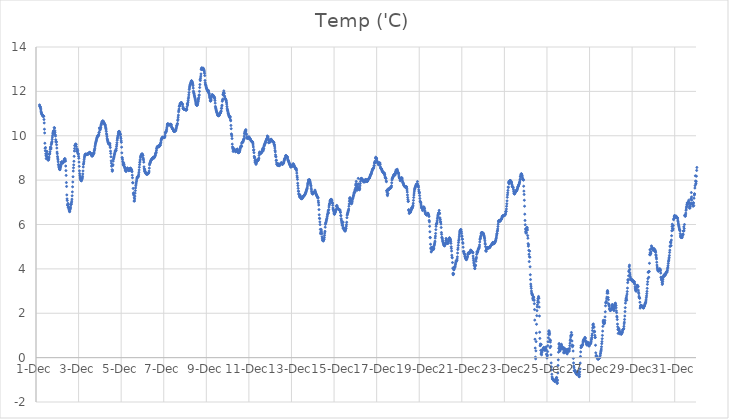
| Category | Temp ('C) |
|---|---|
| 44896.166666666664 | 11.391 |
| 44896.177083333336 | 11.339 |
| 44896.1875 | 11.316 |
| 44896.197916666664 | 11.309 |
| 44896.208333333336 | 11.271 |
| 44896.21875 | 11.222 |
| 44896.229166666664 | 11.162 |
| 44896.239583333336 | 11.088 |
| 44896.25 | 11.041 |
| 44896.260416666664 | 11.013 |
| 44896.270833333336 | 10.977 |
| 44896.28125 | 10.951 |
| 44896.291666666664 | 10.938 |
| 44896.302083333336 | 10.939 |
| 44896.3125 | 10.911 |
| 44896.322916666664 | 10.886 |
| 44896.333333333336 | 10.874 |
| 44896.34375 | 10.889 |
| 44896.354166666664 | 10.885 |
| 44896.364583333336 | 10.873 |
| 44896.375 | 10.732 |
| 44896.385416666664 | 10.577 |
| 44896.395833333336 | 10.295 |
| 44896.40625 | 10.127 |
| 44896.416666666664 | 9.662 |
| 44896.427083333336 | 9.436 |
| 44896.4375 | 9.321 |
| 44896.447916666664 | 9.469 |
| 44896.458333333336 | 9.188 |
| 44896.46875 | 9.108 |
| 44896.479166666664 | 8.969 |
| 44896.489583333336 | 9.061 |
| 44896.5 | 9.306 |
| 44896.510416666664 | 9.278 |
| 44896.520833333336 | 9.178 |
| 44896.53125 | 9.051 |
| 44896.541666666664 | 9.032 |
| 44896.552083333336 | 8.95 |
| 44896.5625 | 8.908 |
| 44896.572916666664 | 8.903 |
| 44896.583333333336 | 8.914 |
| 44896.59375 | 8.925 |
| 44896.604166666664 | 8.995 |
| 44896.614583333336 | 9.039 |
| 44896.625 | 9.162 |
| 44896.635416666664 | 9.163 |
| 44896.645833333336 | 9.211 |
| 44896.65625 | 9.28 |
| 44896.666666666664 | 9.394 |
| 44896.677083333336 | 9.49 |
| 44896.6875 | 9.467 |
| 44896.697916666664 | 9.399 |
| 44896.708333333336 | 9.448 |
| 44896.71875 | 9.598 |
| 44896.729166666664 | 9.654 |
| 44896.739583333336 | 9.693 |
| 44896.75 | 9.741 |
| 44896.760416666664 | 9.843 |
| 44896.770833333336 | 9.94 |
| 44896.78125 | 10.018 |
| 44896.791666666664 | 10.097 |
| 44896.802083333336 | 10.144 |
| 44896.8125 | 10.182 |
| 44896.822916666664 | 10.217 |
| 44896.833333333336 | 10.23 |
| 44896.84375 | 10.131 |
| 44896.854166666664 | 10.368 |
| 44896.864583333336 | 10.097 |
| 44896.875 | 10.349 |
| 44896.885416666664 | 10.229 |
| 44896.895833333336 | 10.158 |
| 44896.90625 | 10.047 |
| 44896.916666666664 | 9.984 |
| 44896.927083333336 | 9.823 |
| 44896.9375 | 9.74 |
| 44896.947916666664 | 9.703 |
| 44896.958333333336 | 9.733 |
| 44896.96875 | 9.595 |
| 44896.979166666664 | 9.445 |
| 44896.989583333336 | 9.265 |
| 44897.0 | 9.19 |
| 44897.010416666664 | 9.067 |
| 44897.020833333336 | 8.992 |
| 44897.03125 | 8.917 |
| 44897.041666666664 | 8.825 |
| 44897.052083333336 | 8.704 |
| 44897.0625 | 8.685 |
| 44897.072916666664 | 8.6 |
| 44897.083333333336 | 8.561 |
| 44897.09375 | 8.501 |
| 44897.104166666664 | 8.502 |
| 44897.114583333336 | 8.482 |
| 44897.125 | 8.467 |
| 44897.135416666664 | 8.526 |
| 44897.145833333336 | 8.573 |
| 44897.15625 | 8.616 |
| 44897.166666666664 | 8.653 |
| 44897.177083333336 | 8.729 |
| 44897.1875 | 8.782 |
| 44897.197916666664 | 8.812 |
| 44897.208333333336 | 8.83 |
| 44897.21875 | 8.805 |
| 44897.229166666664 | 8.784 |
| 44897.239583333336 | 8.779 |
| 44897.25 | 8.771 |
| 44897.260416666664 | 8.77 |
| 44897.270833333336 | 8.783 |
| 44897.28125 | 8.801 |
| 44897.291666666664 | 8.825 |
| 44897.302083333336 | 8.85 |
| 44897.3125 | 8.885 |
| 44897.322916666664 | 8.907 |
| 44897.333333333336 | 8.941 |
| 44897.34375 | 8.941 |
| 44897.354166666664 | 8.971 |
| 44897.364583333336 | 8.951 |
| 44897.375 | 8.905 |
| 44897.385416666664 | 8.853 |
| 44897.395833333336 | 8.636 |
| 44897.40625 | 8.429 |
| 44897.416666666664 | 8.213 |
| 44897.427083333336 | 7.89 |
| 44897.4375 | 7.715 |
| 44897.447916666664 | 7.333 |
| 44897.458333333336 | 7.156 |
| 44897.46875 | 7.08 |
| 44897.479166666664 | 6.883 |
| 44897.489583333336 | 6.858 |
| 44897.5 | 6.948 |
| 44897.510416666664 | 6.778 |
| 44897.520833333336 | 6.909 |
| 44897.53125 | 6.745 |
| 44897.541666666664 | 6.789 |
| 44897.552083333336 | 6.676 |
| 44897.5625 | 6.645 |
| 44897.572916666664 | 6.582 |
| 44897.583333333336 | 6.579 |
| 44897.59375 | 6.657 |
| 44897.604166666664 | 6.696 |
| 44897.614583333336 | 6.724 |
| 44897.625 | 6.783 |
| 44897.635416666664 | 6.898 |
| 44897.645833333336 | 6.896 |
| 44897.65625 | 6.924 |
| 44897.666666666664 | 6.984 |
| 44897.677083333336 | 7.051 |
| 44897.6875 | 7.142 |
| 44897.697916666664 | 7.295 |
| 44897.708333333336 | 7.47 |
| 44897.71875 | 7.698 |
| 44897.729166666664 | 7.916 |
| 44897.739583333336 | 8.153 |
| 44897.75 | 8.409 |
| 44897.760416666664 | 8.556 |
| 44897.770833333336 | 8.687 |
| 44897.78125 | 8.848 |
| 44897.791666666664 | 9.073 |
| 44897.802083333336 | 9.313 |
| 44897.8125 | 9.424 |
| 44897.822916666664 | 9.548 |
| 44897.833333333336 | 9.563 |
| 44897.84375 | 9.586 |
| 44897.854166666664 | 9.618 |
| 44897.864583333336 | 9.623 |
| 44897.875 | 9.593 |
| 44897.885416666664 | 9.617 |
| 44897.895833333336 | 9.508 |
| 44897.90625 | 9.296 |
| 44897.916666666664 | 9.38 |
| 44897.927083333336 | 9.397 |
| 44897.9375 | 9.402 |
| 44897.947916666664 | 9.296 |
| 44897.958333333336 | 9.336 |
| 44897.96875 | 9.21 |
| 44897.979166666664 | 9.182 |
| 44897.989583333336 | 9.176 |
| 44898.0 | 9.075 |
| 44898.010416666664 | 8.984 |
| 44898.020833333336 | 8.813 |
| 44898.03125 | 8.621 |
| 44898.041666666664 | 8.419 |
| 44898.052083333336 | 8.294 |
| 44898.0625 | 8.206 |
| 44898.072916666664 | 8.137 |
| 44898.083333333336 | 8.074 |
| 44898.09375 | 8.039 |
| 44898.104166666664 | 8.009 |
| 44898.114583333336 | 7.985 |
| 44898.125 | 7.979 |
| 44898.135416666664 | 7.968 |
| 44898.145833333336 | 8.045 |
| 44898.15625 | 8.043 |
| 44898.166666666664 | 8.062 |
| 44898.177083333336 | 8.107 |
| 44898.1875 | 8.17 |
| 44898.197916666664 | 8.278 |
| 44898.208333333336 | 8.414 |
| 44898.21875 | 8.592 |
| 44898.229166666664 | 8.709 |
| 44898.239583333336 | 8.765 |
| 44898.25 | 8.825 |
| 44898.260416666664 | 8.917 |
| 44898.270833333336 | 8.997 |
| 44898.28125 | 9.055 |
| 44898.291666666664 | 9.101 |
| 44898.302083333336 | 9.15 |
| 44898.3125 | 9.169 |
| 44898.322916666664 | 9.175 |
| 44898.333333333336 | 9.149 |
| 44898.34375 | 9.141 |
| 44898.354166666664 | 9.146 |
| 44898.364583333336 | 9.156 |
| 44898.375 | 9.161 |
| 44898.385416666664 | 9.165 |
| 44898.395833333336 | 9.17 |
| 44898.40625 | 9.176 |
| 44898.416666666664 | 9.167 |
| 44898.427083333336 | 9.156 |
| 44898.4375 | 9.167 |
| 44898.447916666664 | 9.188 |
| 44898.458333333336 | 9.188 |
| 44898.46875 | 9.213 |
| 44898.479166666664 | 9.219 |
| 44898.489583333336 | 9.213 |
| 44898.5 | 9.225 |
| 44898.510416666664 | 9.229 |
| 44898.520833333336 | 9.254 |
| 44898.53125 | 9.235 |
| 44898.541666666664 | 9.227 |
| 44898.552083333336 | 9.233 |
| 44898.5625 | 9.206 |
| 44898.572916666664 | 9.18 |
| 44898.583333333336 | 9.148 |
| 44898.59375 | 9.143 |
| 44898.604166666664 | 9.134 |
| 44898.614583333336 | 9.112 |
| 44898.625 | 9.083 |
| 44898.635416666664 | 9.084 |
| 44898.645833333336 | 9.094 |
| 44898.65625 | 9.109 |
| 44898.666666666664 | 9.115 |
| 44898.677083333336 | 9.147 |
| 44898.6875 | 9.215 |
| 44898.697916666664 | 9.193 |
| 44898.708333333336 | 9.19 |
| 44898.71875 | 9.209 |
| 44898.729166666664 | 9.261 |
| 44898.739583333336 | 9.324 |
| 44898.75 | 9.373 |
| 44898.760416666664 | 9.427 |
| 44898.770833333336 | 9.501 |
| 44898.78125 | 9.574 |
| 44898.791666666664 | 9.63 |
| 44898.802083333336 | 9.674 |
| 44898.8125 | 9.712 |
| 44898.822916666664 | 9.744 |
| 44898.833333333336 | 9.782 |
| 44898.84375 | 9.826 |
| 44898.854166666664 | 9.874 |
| 44898.864583333336 | 9.914 |
| 44898.875 | 9.938 |
| 44898.885416666664 | 9.964 |
| 44898.895833333336 | 9.98 |
| 44898.90625 | 9.999 |
| 44898.916666666664 | 10.022 |
| 44898.927083333336 | 10.011 |
| 44898.9375 | 10 |
| 44898.947916666664 | 10.064 |
| 44898.958333333336 | 10.136 |
| 44898.96875 | 10.156 |
| 44898.979166666664 | 10.354 |
| 44898.989583333336 | 10.338 |
| 44899.0 | 10.251 |
| 44899.010416666664 | 10.278 |
| 44899.020833333336 | 10.3 |
| 44899.03125 | 10.351 |
| 44899.041666666664 | 10.374 |
| 44899.052083333336 | 10.458 |
| 44899.0625 | 10.506 |
| 44899.072916666664 | 10.541 |
| 44899.083333333336 | 10.557 |
| 44899.09375 | 10.591 |
| 44899.104166666664 | 10.636 |
| 44899.114583333336 | 10.633 |
| 44899.125 | 10.643 |
| 44899.135416666664 | 10.676 |
| 44899.145833333336 | 10.653 |
| 44899.15625 | 10.645 |
| 44899.166666666664 | 10.643 |
| 44899.177083333336 | 10.617 |
| 44899.1875 | 10.585 |
| 44899.197916666664 | 10.578 |
| 44899.208333333336 | 10.552 |
| 44899.21875 | 10.537 |
| 44899.229166666664 | 10.513 |
| 44899.239583333336 | 10.497 |
| 44899.25 | 10.477 |
| 44899.260416666664 | 10.432 |
| 44899.270833333336 | 10.368 |
| 44899.28125 | 10.329 |
| 44899.291666666664 | 10.266 |
| 44899.302083333336 | 10.193 |
| 44899.3125 | 10.094 |
| 44899.322916666664 | 10.039 |
| 44899.333333333336 | 9.956 |
| 44899.34375 | 9.867 |
| 44899.354166666664 | 9.826 |
| 44899.364583333336 | 9.786 |
| 44899.375 | 9.734 |
| 44899.385416666664 | 9.703 |
| 44899.395833333336 | 9.671 |
| 44899.40625 | 9.647 |
| 44899.416666666664 | 9.63 |
| 44899.427083333336 | 9.636 |
| 44899.4375 | 9.631 |
| 44899.447916666664 | 9.624 |
| 44899.458333333336 | 9.611 |
| 44899.46875 | 9.655 |
| 44899.479166666664 | 9.541 |
| 44899.489583333336 | 9.466 |
| 44899.5 | 9.306 |
| 44899.510416666664 | 9.204 |
| 44899.520833333336 | 9.053 |
| 44899.53125 | 8.868 |
| 44899.541666666664 | 8.765 |
| 44899.552083333336 | 8.625 |
| 44899.5625 | 8.664 |
| 44899.572916666664 | 8.47 |
| 44899.583333333336 | 8.399 |
| 44899.59375 | 8.448 |
| 44899.604166666664 | 8.653 |
| 44899.614583333336 | 8.698 |
| 44899.625 | 8.855 |
| 44899.635416666664 | 8.93 |
| 44899.645833333336 | 8.982 |
| 44899.65625 | 9.022 |
| 44899.666666666664 | 9.072 |
| 44899.677083333336 | 9.127 |
| 44899.6875 | 9.162 |
| 44899.697916666664 | 9.214 |
| 44899.708333333336 | 9.263 |
| 44899.71875 | 9.311 |
| 44899.729166666664 | 9.337 |
| 44899.739583333336 | 9.304 |
| 44899.75 | 9.33 |
| 44899.760416666664 | 9.346 |
| 44899.770833333336 | 9.418 |
| 44899.78125 | 9.511 |
| 44899.791666666664 | 9.593 |
| 44899.802083333336 | 9.686 |
| 44899.8125 | 9.797 |
| 44899.822916666664 | 9.862 |
| 44899.833333333336 | 9.917 |
| 44899.84375 | 9.98 |
| 44899.854166666664 | 10.016 |
| 44899.864583333336 | 10.084 |
| 44899.875 | 10.147 |
| 44899.885416666664 | 10.181 |
| 44899.895833333336 | 10.196 |
| 44899.90625 | 10.2 |
| 44899.916666666664 | 10.183 |
| 44899.927083333336 | 10.147 |
| 44899.9375 | 10.105 |
| 44899.947916666664 | 10.07 |
| 44899.958333333336 | 10.046 |
| 44899.96875 | 10.064 |
| 44899.979166666664 | 9.944 |
| 44899.989583333336 | 9.872 |
| 44900.0 | 9.771 |
| 44900.010416666664 | 9.704 |
| 44900.020833333336 | 9.485 |
| 44900.03125 | 9.228 |
| 44900.041666666664 | 9.02 |
| 44900.052083333336 | 8.996 |
| 44900.0625 | 8.93 |
| 44900.072916666664 | 8.842 |
| 44900.083333333336 | 8.774 |
| 44900.09375 | 8.706 |
| 44900.104166666664 | 8.672 |
| 44900.114583333336 | 8.692 |
| 44900.125 | 8.77 |
| 44900.135416666664 | 8.703 |
| 44900.145833333336 | 8.627 |
| 44900.15625 | 8.604 |
| 44900.166666666664 | 8.581 |
| 44900.177083333336 | 8.518 |
| 44900.1875 | 8.504 |
| 44900.197916666664 | 8.434 |
| 44900.208333333336 | 8.444 |
| 44900.21875 | 8.416 |
| 44900.229166666664 | 8.388 |
| 44900.239583333336 | 8.421 |
| 44900.25 | 8.455 |
| 44900.260416666664 | 8.493 |
| 44900.270833333336 | 8.486 |
| 44900.28125 | 8.501 |
| 44900.291666666664 | 8.546 |
| 44900.302083333336 | 8.538 |
| 44900.3125 | 8.506 |
| 44900.322916666664 | 8.478 |
| 44900.333333333336 | 8.459 |
| 44900.34375 | 8.442 |
| 44900.354166666664 | 8.429 |
| 44900.364583333336 | 8.427 |
| 44900.375 | 8.44 |
| 44900.385416666664 | 8.463 |
| 44900.395833333336 | 8.478 |
| 44900.40625 | 8.513 |
| 44900.416666666664 | 8.526 |
| 44900.427083333336 | 8.54 |
| 44900.4375 | 8.531 |
| 44900.447916666664 | 8.522 |
| 44900.458333333336 | 8.505 |
| 44900.46875 | 8.49 |
| 44900.479166666664 | 8.458 |
| 44900.489583333336 | 8.394 |
| 44900.5 | 8.453 |
| 44900.510416666664 | 8.382 |
| 44900.520833333336 | 8.224 |
| 44900.53125 | 8.108 |
| 44900.541666666664 | 7.888 |
| 44900.552083333336 | 7.874 |
| 44900.5625 | 7.625 |
| 44900.572916666664 | 7.383 |
| 44900.583333333336 | 7.428 |
| 44900.59375 | 7.323 |
| 44900.604166666664 | 7.056 |
| 44900.614583333336 | 7.201 |
| 44900.625 | 7.059 |
| 44900.635416666664 | 7.154 |
| 44900.645833333336 | 7.279 |
| 44900.65625 | 7.412 |
| 44900.666666666664 | 7.529 |
| 44900.677083333336 | 7.647 |
| 44900.6875 | 7.747 |
| 44900.697916666664 | 7.821 |
| 44900.708333333336 | 7.874 |
| 44900.71875 | 7.944 |
| 44900.729166666664 | 8.008 |
| 44900.739583333336 | 8.071 |
| 44900.75 | 8.116 |
| 44900.760416666664 | 8.144 |
| 44900.770833333336 | 8.146 |
| 44900.78125 | 8.153 |
| 44900.791666666664 | 8.126 |
| 44900.802083333336 | 8.171 |
| 44900.8125 | 8.195 |
| 44900.822916666664 | 8.269 |
| 44900.833333333336 | 8.356 |
| 44900.84375 | 8.458 |
| 44900.854166666664 | 8.58 |
| 44900.864583333336 | 8.696 |
| 44900.875 | 8.793 |
| 44900.885416666664 | 8.86 |
| 44900.895833333336 | 8.922 |
| 44900.90625 | 9.011 |
| 44900.916666666664 | 9.071 |
| 44900.927083333336 | 9.082 |
| 44900.9375 | 9.115 |
| 44900.947916666664 | 9.142 |
| 44900.958333333336 | 9.155 |
| 44900.96875 | 9.169 |
| 44900.979166666664 | 9.183 |
| 44900.989583333336 | 9.182 |
| 44901.0 | 9.15 |
| 44901.010416666664 | 9.11 |
| 44901.020833333336 | 9.118 |
| 44901.03125 | 9.004 |
| 44901.041666666664 | 8.956 |
| 44901.052083333336 | 8.906 |
| 44901.0625 | 8.81 |
| 44901.072916666664 | 8.599 |
| 44901.083333333336 | 8.51 |
| 44901.09375 | 8.409 |
| 44901.104166666664 | 8.488 |
| 44901.114583333336 | 8.415 |
| 44901.125 | 8.369 |
| 44901.135416666664 | 8.332 |
| 44901.145833333336 | 8.356 |
| 44901.15625 | 8.326 |
| 44901.166666666664 | 8.311 |
| 44901.177083333336 | 8.275 |
| 44901.1875 | 8.274 |
| 44901.197916666664 | 8.269 |
| 44901.208333333336 | 8.27 |
| 44901.21875 | 8.28 |
| 44901.229166666664 | 8.28 |
| 44901.239583333336 | 8.278 |
| 44901.25 | 8.275 |
| 44901.260416666664 | 8.291 |
| 44901.270833333336 | 8.308 |
| 44901.28125 | 8.316 |
| 44901.291666666664 | 8.321 |
| 44901.302083333336 | 8.357 |
| 44901.3125 | 8.409 |
| 44901.322916666664 | 8.541 |
| 44901.333333333336 | 8.687 |
| 44901.34375 | 8.739 |
| 44901.354166666664 | 8.766 |
| 44901.364583333336 | 8.792 |
| 44901.375 | 8.829 |
| 44901.385416666664 | 8.856 |
| 44901.395833333336 | 8.879 |
| 44901.40625 | 8.905 |
| 44901.416666666664 | 8.922 |
| 44901.427083333336 | 8.924 |
| 44901.4375 | 8.94 |
| 44901.447916666664 | 8.957 |
| 44901.458333333336 | 8.966 |
| 44901.46875 | 8.98 |
| 44901.479166666664 | 8.997 |
| 44901.489583333336 | 9.015 |
| 44901.5 | 9.014 |
| 44901.510416666664 | 9.017 |
| 44901.520833333336 | 9.01 |
| 44901.53125 | 8.983 |
| 44901.541666666664 | 9.013 |
| 44901.552083333336 | 9.038 |
| 44901.5625 | 9.049 |
| 44901.572916666664 | 9.054 |
| 44901.583333333336 | 9.075 |
| 44901.59375 | 9.107 |
| 44901.604166666664 | 9.125 |
| 44901.614583333336 | 9.185 |
| 44901.625 | 9.209 |
| 44901.635416666664 | 9.233 |
| 44901.645833333336 | 9.264 |
| 44901.65625 | 9.344 |
| 44901.666666666664 | 9.425 |
| 44901.677083333336 | 9.438 |
| 44901.6875 | 9.477 |
| 44901.697916666664 | 9.509 |
| 44901.708333333336 | 9.511 |
| 44901.71875 | 9.495 |
| 44901.729166666664 | 9.524 |
| 44901.739583333336 | 9.513 |
| 44901.75 | 9.546 |
| 44901.760416666664 | 9.51 |
| 44901.770833333336 | 9.51 |
| 44901.78125 | 9.503 |
| 44901.791666666664 | 9.521 |
| 44901.802083333336 | 9.589 |
| 44901.8125 | 9.566 |
| 44901.822916666664 | 9.567 |
| 44901.833333333336 | 9.565 |
| 44901.84375 | 9.626 |
| 44901.854166666664 | 9.662 |
| 44901.864583333336 | 9.704 |
| 44901.875 | 9.771 |
| 44901.885416666664 | 9.82 |
| 44901.895833333336 | 9.849 |
| 44901.90625 | 9.88 |
| 44901.916666666664 | 9.894 |
| 44901.927083333336 | 9.915 |
| 44901.9375 | 9.926 |
| 44901.947916666664 | 9.929 |
| 44901.958333333336 | 9.932 |
| 44901.96875 | 9.928 |
| 44901.979166666664 | 9.923 |
| 44901.989583333336 | 9.921 |
| 44902.0 | 9.918 |
| 44902.010416666664 | 9.916 |
| 44902.020833333336 | 9.918 |
| 44902.03125 | 9.919 |
| 44902.041666666664 | 9.923 |
| 44902.052083333336 | 9.969 |
| 44902.0625 | 10.027 |
| 44902.072916666664 | 10.134 |
| 44902.083333333336 | 10.136 |
| 44902.09375 | 10.152 |
| 44902.104166666664 | 10.18 |
| 44902.114583333336 | 10.188 |
| 44902.125 | 10.229 |
| 44902.135416666664 | 10.291 |
| 44902.145833333336 | 10.355 |
| 44902.15625 | 10.437 |
| 44902.166666666664 | 10.525 |
| 44902.177083333336 | 10.517 |
| 44902.1875 | 10.534 |
| 44902.197916666664 | 10.528 |
| 44902.208333333336 | 10.535 |
| 44902.21875 | 10.503 |
| 44902.229166666664 | 10.5 |
| 44902.239583333336 | 10.477 |
| 44902.25 | 10.482 |
| 44902.260416666664 | 10.492 |
| 44902.270833333336 | 10.499 |
| 44902.28125 | 10.496 |
| 44902.291666666664 | 10.513 |
| 44902.302083333336 | 10.527 |
| 44902.3125 | 10.508 |
| 44902.322916666664 | 10.503 |
| 44902.333333333336 | 10.51 |
| 44902.34375 | 10.517 |
| 44902.354166666664 | 10.481 |
| 44902.364583333336 | 10.422 |
| 44902.375 | 10.377 |
| 44902.385416666664 | 10.364 |
| 44902.395833333336 | 10.351 |
| 44902.40625 | 10.322 |
| 44902.416666666664 | 10.305 |
| 44902.427083333336 | 10.301 |
| 44902.4375 | 10.286 |
| 44902.447916666664 | 10.267 |
| 44902.458333333336 | 10.243 |
| 44902.46875 | 10.21 |
| 44902.479166666664 | 10.196 |
| 44902.489583333336 | 10.194 |
| 44902.5 | 10.202 |
| 44902.510416666664 | 10.196 |
| 44902.520833333336 | 10.206 |
| 44902.53125 | 10.213 |
| 44902.541666666664 | 10.224 |
| 44902.552083333336 | 10.23 |
| 44902.5625 | 10.242 |
| 44902.572916666664 | 10.307 |
| 44902.583333333336 | 10.308 |
| 44902.59375 | 10.367 |
| 44902.604166666664 | 10.434 |
| 44902.614583333336 | 10.459 |
| 44902.625 | 10.489 |
| 44902.635416666664 | 10.534 |
| 44902.645833333336 | 10.552 |
| 44902.65625 | 10.684 |
| 44902.666666666664 | 10.739 |
| 44902.677083333336 | 10.838 |
| 44902.6875 | 10.93 |
| 44902.697916666664 | 11.076 |
| 44902.708333333336 | 11.148 |
| 44902.71875 | 11.205 |
| 44902.729166666664 | 11.325 |
| 44902.739583333336 | 11.333 |
| 44902.75 | 11.363 |
| 44902.760416666664 | 11.427 |
| 44902.770833333336 | 11.424 |
| 44902.78125 | 11.456 |
| 44902.791666666664 | 11.448 |
| 44902.802083333336 | 11.472 |
| 44902.8125 | 11.487 |
| 44902.822916666664 | 11.491 |
| 44902.833333333336 | 11.496 |
| 44902.84375 | 11.478 |
| 44902.854166666664 | 11.453 |
| 44902.864583333336 | 11.434 |
| 44902.875 | 11.432 |
| 44902.885416666664 | 11.394 |
| 44902.895833333336 | 11.309 |
| 44902.90625 | 11.242 |
| 44902.916666666664 | 11.219 |
| 44902.927083333336 | 11.21 |
| 44902.9375 | 11.199 |
| 44902.947916666664 | 11.198 |
| 44902.958333333336 | 11.203 |
| 44902.96875 | 11.204 |
| 44902.979166666664 | 11.188 |
| 44902.989583333336 | 11.19 |
| 44903.0 | 11.191 |
| 44903.010416666664 | 11.185 |
| 44903.020833333336 | 11.178 |
| 44903.03125 | 11.17 |
| 44903.041666666664 | 11.159 |
| 44903.052083333336 | 11.153 |
| 44903.0625 | 11.159 |
| 44903.072916666664 | 11.19 |
| 44903.083333333336 | 11.198 |
| 44903.09375 | 11.302 |
| 44903.104166666664 | 11.436 |
| 44903.114583333336 | 11.426 |
| 44903.125 | 11.384 |
| 44903.135416666664 | 11.506 |
| 44903.145833333336 | 11.581 |
| 44903.15625 | 11.667 |
| 44903.166666666664 | 11.741 |
| 44903.177083333336 | 11.842 |
| 44903.1875 | 11.945 |
| 44903.197916666664 | 12.081 |
| 44903.208333333336 | 12.151 |
| 44903.21875 | 12.216 |
| 44903.229166666664 | 12.262 |
| 44903.239583333336 | 12.297 |
| 44903.25 | 12.318 |
| 44903.260416666664 | 12.353 |
| 44903.270833333336 | 12.386 |
| 44903.28125 | 12.422 |
| 44903.291666666664 | 12.458 |
| 44903.302083333336 | 12.479 |
| 44903.3125 | 12.472 |
| 44903.322916666664 | 12.448 |
| 44903.333333333336 | 12.428 |
| 44903.34375 | 12.397 |
| 44903.354166666664 | 12.363 |
| 44903.364583333336 | 12.322 |
| 44903.375 | 12.259 |
| 44903.385416666664 | 12.148 |
| 44903.395833333336 | 12.01 |
| 44903.40625 | 11.953 |
| 44903.416666666664 | 11.905 |
| 44903.427083333336 | 11.879 |
| 44903.4375 | 11.824 |
| 44903.447916666664 | 11.775 |
| 44903.458333333336 | 11.737 |
| 44903.46875 | 11.693 |
| 44903.479166666664 | 11.647 |
| 44903.489583333336 | 11.582 |
| 44903.5 | 11.521 |
| 44903.510416666664 | 11.463 |
| 44903.520833333336 | 11.417 |
| 44903.53125 | 11.393 |
| 44903.541666666664 | 11.378 |
| 44903.552083333336 | 11.372 |
| 44903.5625 | 11.373 |
| 44903.572916666664 | 11.384 |
| 44903.583333333336 | 11.402 |
| 44903.59375 | 11.458 |
| 44903.604166666664 | 11.647 |
| 44903.614583333336 | 11.525 |
| 44903.625 | 11.569 |
| 44903.635416666664 | 11.656 |
| 44903.645833333336 | 11.713 |
| 44903.65625 | 11.81 |
| 44903.666666666664 | 11.844 |
| 44903.677083333336 | 12 |
| 44903.6875 | 12.174 |
| 44903.697916666664 | 12.309 |
| 44903.708333333336 | 12.535 |
| 44903.71875 | 12.487 |
| 44903.729166666664 | 12.598 |
| 44903.739583333336 | 12.686 |
| 44903.75 | 12.787 |
| 44903.760416666664 | 12.984 |
| 44903.770833333336 | 13.025 |
| 44903.78125 | 13.062 |
| 44903.791666666664 | 13.019 |
| 44903.802083333336 | 12.994 |
| 44903.8125 | 12.993 |
| 44903.822916666664 | 13.043 |
| 44903.833333333336 | 13.03 |
| 44903.84375 | 13.043 |
| 44903.854166666664 | 13.044 |
| 44903.864583333336 | 13.01 |
| 44903.875 | 12.979 |
| 44903.885416666664 | 12.966 |
| 44903.895833333336 | 12.939 |
| 44903.90625 | 12.878 |
| 44903.916666666664 | 12.811 |
| 44903.927083333336 | 12.711 |
| 44903.9375 | 12.491 |
| 44903.947916666664 | 12.385 |
| 44903.958333333336 | 12.318 |
| 44903.96875 | 12.297 |
| 44903.979166666664 | 12.267 |
| 44903.989583333336 | 12.225 |
| 44904.0 | 12.172 |
| 44904.010416666664 | 12.138 |
| 44904.020833333336 | 12.116 |
| 44904.03125 | 12.076 |
| 44904.041666666664 | 12.064 |
| 44904.052083333336 | 12.044 |
| 44904.0625 | 12.023 |
| 44904.072916666664 | 12.007 |
| 44904.083333333336 | 11.991 |
| 44904.09375 | 12.001 |
| 44904.104166666664 | 12.039 |
| 44904.114583333336 | 11.947 |
| 44904.125 | 11.895 |
| 44904.135416666664 | 11.887 |
| 44904.145833333336 | 11.804 |
| 44904.15625 | 11.747 |
| 44904.166666666664 | 11.715 |
| 44904.177083333336 | 11.687 |
| 44904.1875 | 11.592 |
| 44904.197916666664 | 11.554 |
| 44904.208333333336 | 11.608 |
| 44904.21875 | 11.581 |
| 44904.229166666664 | 11.655 |
| 44904.239583333336 | 11.776 |
| 44904.25 | 11.753 |
| 44904.260416666664 | 11.839 |
| 44904.270833333336 | 11.845 |
| 44904.28125 | 11.838 |
| 44904.291666666664 | 11.833 |
| 44904.302083333336 | 11.837 |
| 44904.3125 | 11.819 |
| 44904.322916666664 | 11.81 |
| 44904.333333333336 | 11.807 |
| 44904.34375 | 11.781 |
| 44904.354166666664 | 11.757 |
| 44904.364583333336 | 11.725 |
| 44904.375 | 11.741 |
| 44904.385416666664 | 11.721 |
| 44904.395833333336 | 11.662 |
| 44904.40625 | 11.589 |
| 44904.416666666664 | 11.471 |
| 44904.427083333336 | 11.322 |
| 44904.4375 | 11.263 |
| 44904.447916666664 | 11.224 |
| 44904.458333333336 | 11.175 |
| 44904.46875 | 11.142 |
| 44904.479166666664 | 11.088 |
| 44904.489583333336 | 11.069 |
| 44904.5 | 11.041 |
| 44904.510416666664 | 11.012 |
| 44904.520833333336 | 10.967 |
| 44904.53125 | 10.937 |
| 44904.541666666664 | 10.915 |
| 44904.552083333336 | 10.904 |
| 44904.5625 | 10.911 |
| 44904.572916666664 | 10.902 |
| 44904.583333333336 | 10.906 |
| 44904.59375 | 10.912 |
| 44904.604166666664 | 10.913 |
| 44904.614583333336 | 10.946 |
| 44904.625 | 11.003 |
| 44904.635416666664 | 11.017 |
| 44904.645833333336 | 11.013 |
| 44904.65625 | 11.02 |
| 44904.666666666664 | 11.026 |
| 44904.677083333336 | 11.069 |
| 44904.6875 | 11.109 |
| 44904.697916666664 | 11.11 |
| 44904.708333333336 | 11.234 |
| 44904.71875 | 11.233 |
| 44904.729166666664 | 11.341 |
| 44904.739583333336 | 11.379 |
| 44904.75 | 11.553 |
| 44904.760416666664 | 11.607 |
| 44904.770833333336 | 11.651 |
| 44904.78125 | 11.868 |
| 44904.791666666664 | 11.836 |
| 44904.802083333336 | 11.933 |
| 44904.8125 | 11.949 |
| 44904.822916666664 | 12.023 |
| 44904.833333333336 | 11.93 |
| 44904.84375 | 11.908 |
| 44904.854166666664 | 11.796 |
| 44904.864583333336 | 11.752 |
| 44904.875 | 11.699 |
| 44904.885416666664 | 11.672 |
| 44904.895833333336 | 11.654 |
| 44904.90625 | 11.648 |
| 44904.916666666664 | 11.644 |
| 44904.927083333336 | 11.597 |
| 44904.9375 | 11.564 |
| 44904.947916666664 | 11.502 |
| 44904.958333333336 | 11.426 |
| 44904.96875 | 11.323 |
| 44904.979166666664 | 11.241 |
| 44904.989583333336 | 11.181 |
| 44905.0 | 11.143 |
| 44905.010416666664 | 11.102 |
| 44905.020833333336 | 11.032 |
| 44905.03125 | 11.012 |
| 44905.041666666664 | 10.971 |
| 44905.052083333336 | 10.938 |
| 44905.0625 | 10.911 |
| 44905.072916666664 | 10.875 |
| 44905.083333333336 | 10.861 |
| 44905.09375 | 10.846 |
| 44905.104166666664 | 10.816 |
| 44905.114583333336 | 10.803 |
| 44905.125 | 10.864 |
| 44905.135416666664 | 10.714 |
| 44905.145833333336 | 10.674 |
| 44905.15625 | 10.465 |
| 44905.166666666664 | 10.317 |
| 44905.177083333336 | 10.085 |
| 44905.1875 | 10.048 |
| 44905.197916666664 | 9.989 |
| 44905.208333333336 | 9.873 |
| 44905.21875 | 9.623 |
| 44905.229166666664 | 9.499 |
| 44905.239583333336 | 9.412 |
| 44905.25 | 9.461 |
| 44905.260416666664 | 9.292 |
| 44905.270833333336 | 9.343 |
| 44905.28125 | 9.332 |
| 44905.291666666664 | 9.358 |
| 44905.302083333336 | 9.355 |
| 44905.3125 | 9.401 |
| 44905.322916666664 | 9.357 |
| 44905.333333333336 | 9.367 |
| 44905.34375 | 9.352 |
| 44905.354166666664 | 9.311 |
| 44905.364583333336 | 9.301 |
| 44905.375 | 9.276 |
| 44905.385416666664 | 9.314 |
| 44905.395833333336 | 9.315 |
| 44905.40625 | 9.318 |
| 44905.416666666664 | 9.314 |
| 44905.427083333336 | 9.343 |
| 44905.4375 | 9.372 |
| 44905.447916666664 | 9.395 |
| 44905.458333333336 | 9.398 |
| 44905.46875 | 9.343 |
| 44905.479166666664 | 9.297 |
| 44905.489583333336 | 9.256 |
| 44905.5 | 9.239 |
| 44905.510416666664 | 9.24 |
| 44905.520833333336 | 9.239 |
| 44905.53125 | 9.247 |
| 44905.541666666664 | 9.263 |
| 44905.552083333336 | 9.272 |
| 44905.5625 | 9.305 |
| 44905.572916666664 | 9.34 |
| 44905.583333333336 | 9.39 |
| 44905.59375 | 9.438 |
| 44905.604166666664 | 9.475 |
| 44905.614583333336 | 9.487 |
| 44905.625 | 9.521 |
| 44905.635416666664 | 9.555 |
| 44905.645833333336 | 9.52 |
| 44905.65625 | 9.518 |
| 44905.666666666664 | 9.659 |
| 44905.677083333336 | 9.685 |
| 44905.6875 | 9.697 |
| 44905.697916666664 | 9.71 |
| 44905.708333333336 | 9.727 |
| 44905.71875 | 9.714 |
| 44905.729166666664 | 9.753 |
| 44905.739583333336 | 9.783 |
| 44905.75 | 9.832 |
| 44905.760416666664 | 9.837 |
| 44905.770833333336 | 9.876 |
| 44905.78125 | 9.979 |
| 44905.791666666664 | 10.089 |
| 44905.802083333336 | 10.127 |
| 44905.8125 | 10.176 |
| 44905.822916666664 | 10.175 |
| 44905.833333333336 | 10.231 |
| 44905.84375 | 10.228 |
| 44905.854166666664 | 10.276 |
| 44905.864583333336 | 10.215 |
| 44905.875 | 10.101 |
| 44905.885416666664 | 10.045 |
| 44905.895833333336 | 9.916 |
| 44905.90625 | 9.887 |
| 44905.916666666664 | 9.906 |
| 44905.927083333336 | 9.929 |
| 44905.9375 | 9.898 |
| 44905.947916666664 | 9.892 |
| 44905.958333333336 | 9.919 |
| 44905.96875 | 9.887 |
| 44905.979166666664 | 9.876 |
| 44905.989583333336 | 9.919 |
| 44906.0 | 9.958 |
| 44906.010416666664 | 9.929 |
| 44906.020833333336 | 9.893 |
| 44906.03125 | 9.883 |
| 44906.041666666664 | 9.882 |
| 44906.052083333336 | 9.871 |
| 44906.0625 | 9.85 |
| 44906.072916666664 | 9.832 |
| 44906.083333333336 | 9.813 |
| 44906.09375 | 9.791 |
| 44906.104166666664 | 9.764 |
| 44906.114583333336 | 9.762 |
| 44906.125 | 9.755 |
| 44906.135416666664 | 9.739 |
| 44906.145833333336 | 9.731 |
| 44906.15625 | 9.73 |
| 44906.166666666664 | 9.73 |
| 44906.177083333336 | 9.701 |
| 44906.1875 | 9.641 |
| 44906.197916666664 | 9.582 |
| 44906.208333333336 | 9.494 |
| 44906.21875 | 9.34 |
| 44906.229166666664 | 9.375 |
| 44906.239583333336 | 9.238 |
| 44906.25 | 9.074 |
| 44906.260416666664 | 8.996 |
| 44906.270833333336 | 9.03 |
| 44906.28125 | 8.867 |
| 44906.291666666664 | 8.794 |
| 44906.302083333336 | 8.909 |
| 44906.3125 | 8.89 |
| 44906.322916666664 | 8.794 |
| 44906.333333333336 | 8.709 |
| 44906.34375 | 8.75 |
| 44906.354166666664 | 8.795 |
| 44906.364583333336 | 8.904 |
| 44906.375 | 8.874 |
| 44906.385416666664 | 8.871 |
| 44906.395833333336 | 8.862 |
| 44906.40625 | 8.879 |
| 44906.416666666664 | 8.88 |
| 44906.427083333336 | 8.882 |
| 44906.4375 | 8.901 |
| 44906.447916666664 | 8.941 |
| 44906.458333333336 | 8.967 |
| 44906.46875 | 8.995 |
| 44906.479166666664 | 9.114 |
| 44906.489583333336 | 9.207 |
| 44906.5 | 9.251 |
| 44906.510416666664 | 9.268 |
| 44906.520833333336 | 9.245 |
| 44906.53125 | 9.222 |
| 44906.541666666664 | 9.211 |
| 44906.552083333336 | 9.204 |
| 44906.5625 | 9.205 |
| 44906.572916666664 | 9.222 |
| 44906.583333333336 | 9.242 |
| 44906.59375 | 9.25 |
| 44906.604166666664 | 9.264 |
| 44906.614583333336 | 9.286 |
| 44906.625 | 9.32 |
| 44906.635416666664 | 9.37 |
| 44906.645833333336 | 9.388 |
| 44906.65625 | 9.427 |
| 44906.666666666664 | 9.446 |
| 44906.677083333336 | 9.323 |
| 44906.6875 | 9.408 |
| 44906.697916666664 | 9.42 |
| 44906.708333333336 | 9.521 |
| 44906.71875 | 9.561 |
| 44906.729166666664 | 9.595 |
| 44906.739583333336 | 9.607 |
| 44906.75 | 9.642 |
| 44906.760416666664 | 9.668 |
| 44906.770833333336 | 9.683 |
| 44906.78125 | 9.715 |
| 44906.791666666664 | 9.751 |
| 44906.802083333336 | 9.763 |
| 44906.8125 | 9.798 |
| 44906.822916666664 | 9.836 |
| 44906.833333333336 | 9.822 |
| 44906.84375 | 9.874 |
| 44906.854166666664 | 9.889 |
| 44906.864583333336 | 9.993 |
| 44906.875 | 9.924 |
| 44906.885416666664 | 9.953 |
| 44906.895833333336 | 9.949 |
| 44906.90625 | 9.89 |
| 44906.916666666664 | 9.844 |
| 44906.927083333336 | 9.686 |
| 44906.9375 | 9.695 |
| 44906.947916666664 | 9.769 |
| 44906.958333333336 | 9.763 |
| 44906.96875 | 9.723 |
| 44906.979166666664 | 9.715 |
| 44906.989583333336 | 9.739 |
| 44907.0 | 9.743 |
| 44907.010416666664 | 9.724 |
| 44907.020833333336 | 9.757 |
| 44907.03125 | 9.829 |
| 44907.041666666664 | 9.846 |
| 44907.052083333336 | 9.828 |
| 44907.0625 | 9.814 |
| 44907.072916666664 | 9.801 |
| 44907.083333333336 | 9.784 |
| 44907.09375 | 9.776 |
| 44907.104166666664 | 9.768 |
| 44907.114583333336 | 9.755 |
| 44907.125 | 9.745 |
| 44907.135416666664 | 9.732 |
| 44907.145833333336 | 9.726 |
| 44907.15625 | 9.698 |
| 44907.166666666664 | 9.693 |
| 44907.177083333336 | 9.675 |
| 44907.1875 | 9.61 |
| 44907.197916666664 | 9.586 |
| 44907.208333333336 | 9.529 |
| 44907.21875 | 9.446 |
| 44907.229166666664 | 9.34 |
| 44907.239583333336 | 9.272 |
| 44907.25 | 9.139 |
| 44907.260416666664 | 9.067 |
| 44907.270833333336 | 9.047 |
| 44907.28125 | 8.881 |
| 44907.291666666664 | 8.9 |
| 44907.302083333336 | 8.778 |
| 44907.3125 | 8.718 |
| 44907.322916666664 | 8.703 |
| 44907.333333333336 | 8.707 |
| 44907.34375 | 8.66 |
| 44907.354166666664 | 8.739 |
| 44907.364583333336 | 8.718 |
| 44907.375 | 8.734 |
| 44907.385416666664 | 8.685 |
| 44907.395833333336 | 8.672 |
| 44907.40625 | 8.669 |
| 44907.416666666664 | 8.644 |
| 44907.427083333336 | 8.659 |
| 44907.4375 | 8.662 |
| 44907.447916666664 | 8.675 |
| 44907.458333333336 | 8.681 |
| 44907.46875 | 8.709 |
| 44907.479166666664 | 8.728 |
| 44907.489583333336 | 8.734 |
| 44907.5 | 8.751 |
| 44907.510416666664 | 8.773 |
| 44907.520833333336 | 8.784 |
| 44907.53125 | 8.773 |
| 44907.541666666664 | 8.753 |
| 44907.552083333336 | 8.734 |
| 44907.5625 | 8.723 |
| 44907.572916666664 | 8.711 |
| 44907.583333333336 | 8.715 |
| 44907.59375 | 8.723 |
| 44907.604166666664 | 8.74 |
| 44907.614583333336 | 8.759 |
| 44907.625 | 8.773 |
| 44907.635416666664 | 8.807 |
| 44907.645833333336 | 8.839 |
| 44907.65625 | 8.886 |
| 44907.666666666664 | 8.916 |
| 44907.677083333336 | 8.955 |
| 44907.6875 | 8.988 |
| 44907.697916666664 | 8.987 |
| 44907.708333333336 | 8.993 |
| 44907.71875 | 9.04 |
| 44907.729166666664 | 9.109 |
| 44907.739583333336 | 9.099 |
| 44907.75 | 9.099 |
| 44907.760416666664 | 9.07 |
| 44907.770833333336 | 9.069 |
| 44907.78125 | 9.059 |
| 44907.791666666664 | 9.043 |
| 44907.802083333336 | 9.025 |
| 44907.8125 | 9.04 |
| 44907.822916666664 | 8.949 |
| 44907.833333333336 | 8.906 |
| 44907.84375 | 8.9 |
| 44907.854166666664 | 8.87 |
| 44907.864583333336 | 8.846 |
| 44907.875 | 8.817 |
| 44907.885416666664 | 8.798 |
| 44907.895833333336 | 8.761 |
| 44907.90625 | 8.731 |
| 44907.916666666664 | 8.709 |
| 44907.927083333336 | 8.681 |
| 44907.9375 | 8.653 |
| 44907.947916666664 | 8.7 |
| 44907.958333333336 | 8.602 |
| 44907.96875 | 8.599 |
| 44907.979166666664 | 8.586 |
| 44907.989583333336 | 8.646 |
| 44908.0 | 8.637 |
| 44908.010416666664 | 8.629 |
| 44908.020833333336 | 8.644 |
| 44908.03125 | 8.647 |
| 44908.041666666664 | 8.641 |
| 44908.052083333336 | 8.629 |
| 44908.0625 | 8.659 |
| 44908.072916666664 | 8.733 |
| 44908.083333333336 | 8.737 |
| 44908.09375 | 8.704 |
| 44908.104166666664 | 8.691 |
| 44908.114583333336 | 8.679 |
| 44908.125 | 8.65 |
| 44908.135416666664 | 8.627 |
| 44908.145833333336 | 8.599 |
| 44908.15625 | 8.581 |
| 44908.166666666664 | 8.556 |
| 44908.177083333336 | 8.551 |
| 44908.1875 | 8.518 |
| 44908.197916666664 | 8.499 |
| 44908.208333333336 | 8.542 |
| 44908.21875 | 8.507 |
| 44908.229166666664 | 8.485 |
| 44908.239583333336 | 8.423 |
| 44908.25 | 8.317 |
| 44908.260416666664 | 8.194 |
| 44908.270833333336 | 8.127 |
| 44908.28125 | 8.034 |
| 44908.291666666664 | 7.86 |
| 44908.302083333336 | 7.753 |
| 44908.3125 | 7.628 |
| 44908.322916666664 | 7.499 |
| 44908.333333333336 | 7.495 |
| 44908.34375 | 7.386 |
| 44908.354166666664 | 7.36 |
| 44908.364583333336 | 7.354 |
| 44908.375 | 7.276 |
| 44908.385416666664 | 7.23 |
| 44908.395833333336 | 7.33 |
| 44908.40625 | 7.311 |
| 44908.416666666664 | 7.27 |
| 44908.427083333336 | 7.238 |
| 44908.4375 | 7.23 |
| 44908.447916666664 | 7.178 |
| 44908.458333333336 | 7.158 |
| 44908.46875 | 7.184 |
| 44908.479166666664 | 7.169 |
| 44908.489583333336 | 7.168 |
| 44908.5 | 7.166 |
| 44908.510416666664 | 7.21 |
| 44908.520833333336 | 7.243 |
| 44908.53125 | 7.245 |
| 44908.541666666664 | 7.221 |
| 44908.552083333336 | 7.256 |
| 44908.5625 | 7.277 |
| 44908.572916666664 | 7.284 |
| 44908.583333333336 | 7.288 |
| 44908.59375 | 7.3 |
| 44908.604166666664 | 7.308 |
| 44908.614583333336 | 7.315 |
| 44908.625 | 7.336 |
| 44908.635416666664 | 7.359 |
| 44908.645833333336 | 7.38 |
| 44908.65625 | 7.41 |
| 44908.666666666664 | 7.433 |
| 44908.677083333336 | 7.461 |
| 44908.6875 | 7.482 |
| 44908.697916666664 | 7.52 |
| 44908.708333333336 | 7.564 |
| 44908.71875 | 7.586 |
| 44908.729166666664 | 7.621 |
| 44908.739583333336 | 7.651 |
| 44908.75 | 7.735 |
| 44908.760416666664 | 7.817 |
| 44908.770833333336 | 7.852 |
| 44908.78125 | 7.894 |
| 44908.791666666664 | 8.009 |
| 44908.802083333336 | 7.958 |
| 44908.8125 | 7.952 |
| 44908.822916666664 | 8.002 |
| 44908.833333333336 | 8.013 |
| 44908.84375 | 8.021 |
| 44908.854166666664 | 8.006 |
| 44908.864583333336 | 7.962 |
| 44908.875 | 7.924 |
| 44908.885416666664 | 7.873 |
| 44908.895833333336 | 7.823 |
| 44908.90625 | 7.764 |
| 44908.916666666664 | 7.734 |
| 44908.927083333336 | 7.637 |
| 44908.9375 | 7.561 |
| 44908.947916666664 | 7.479 |
| 44908.958333333336 | 7.462 |
| 44908.96875 | 7.402 |
| 44908.979166666664 | 7.406 |
| 44908.989583333336 | 7.386 |
| 44909.0 | 7.368 |
| 44909.010416666664 | 7.415 |
| 44909.020833333336 | 7.412 |
| 44909.03125 | 7.411 |
| 44909.041666666664 | 7.432 |
| 44909.052083333336 | 7.457 |
| 44909.0625 | 7.462 |
| 44909.072916666664 | 7.45 |
| 44909.083333333336 | 7.437 |
| 44909.09375 | 7.482 |
| 44909.104166666664 | 7.55 |
| 44909.114583333336 | 7.501 |
| 44909.125 | 7.456 |
| 44909.135416666664 | 7.421 |
| 44909.145833333336 | 7.405 |
| 44909.15625 | 7.372 |
| 44909.166666666664 | 7.345 |
| 44909.177083333336 | 7.327 |
| 44909.1875 | 7.301 |
| 44909.197916666664 | 7.28 |
| 44909.208333333336 | 7.258 |
| 44909.21875 | 7.243 |
| 44909.229166666664 | 7.213 |
| 44909.239583333336 | 7.193 |
| 44909.25 | 7.204 |
| 44909.260416666664 | 7.064 |
| 44909.270833333336 | 6.981 |
| 44909.28125 | 6.878 |
| 44909.291666666664 | 6.671 |
| 44909.302083333336 | 6.438 |
| 44909.3125 | 6.281 |
| 44909.322916666664 | 6.266 |
| 44909.333333333336 | 6.117 |
| 44909.34375 | 5.996 |
| 44909.354166666664 | 5.78 |
| 44909.364583333336 | 5.586 |
| 44909.375 | 5.626 |
| 44909.385416666664 | 5.672 |
| 44909.395833333336 | 5.781 |
| 44909.40625 | 5.704 |
| 44909.416666666664 | 5.593 |
| 44909.427083333336 | 5.595 |
| 44909.4375 | 5.449 |
| 44909.447916666664 | 5.381 |
| 44909.458333333336 | 5.314 |
| 44909.46875 | 5.273 |
| 44909.479166666664 | 5.268 |
| 44909.489583333336 | 5.262 |
| 44909.5 | 5.263 |
| 44909.510416666664 | 5.305 |
| 44909.520833333336 | 5.332 |
| 44909.53125 | 5.345 |
| 44909.541666666664 | 5.419 |
| 44909.552083333336 | 5.514 |
| 44909.5625 | 5.619 |
| 44909.572916666664 | 5.694 |
| 44909.583333333336 | 5.879 |
| 44909.59375 | 6.005 |
| 44909.604166666664 | 6.064 |
| 44909.614583333336 | 6.073 |
| 44909.625 | 6.116 |
| 44909.635416666664 | 6.162 |
| 44909.645833333336 | 6.212 |
| 44909.65625 | 6.253 |
| 44909.666666666664 | 6.289 |
| 44909.677083333336 | 6.351 |
| 44909.6875 | 6.429 |
| 44909.697916666664 | 6.465 |
| 44909.708333333336 | 6.515 |
| 44909.71875 | 6.569 |
| 44909.729166666664 | 6.638 |
| 44909.739583333336 | 6.522 |
| 44909.75 | 6.67 |
| 44909.760416666664 | 6.787 |
| 44909.770833333336 | 6.87 |
| 44909.78125 | 6.917 |
| 44909.791666666664 | 6.94 |
| 44909.802083333336 | 7.013 |
| 44909.8125 | 7.064 |
| 44909.822916666664 | 7.098 |
| 44909.833333333336 | 7.074 |
| 44909.84375 | 7.126 |
| 44909.854166666664 | 7.122 |
| 44909.864583333336 | 7.12 |
| 44909.875 | 7.131 |
| 44909.885416666664 | 7.116 |
| 44909.895833333336 | 7.079 |
| 44909.90625 | 7.007 |
| 44909.916666666664 | 6.976 |
| 44909.927083333336 | 6.956 |
| 44909.9375 | 6.865 |
| 44909.947916666664 | 6.745 |
| 44909.958333333336 | 6.693 |
| 44909.96875 | 6.669 |
| 44909.979166666664 | 6.624 |
| 44909.989583333336 | 6.571 |
| 44910.0 | 6.505 |
| 44910.010416666664 | 6.468 |
| 44910.020833333336 | 6.457 |
| 44910.03125 | 6.519 |
| 44910.041666666664 | 6.53 |
| 44910.052083333336 | 6.527 |
| 44910.0625 | 6.568 |
| 44910.072916666664 | 6.616 |
| 44910.083333333336 | 6.655 |
| 44910.09375 | 6.645 |
| 44910.104166666664 | 6.683 |
| 44910.114583333336 | 6.812 |
| 44910.125 | 6.859 |
| 44910.135416666664 | 6.844 |
| 44910.145833333336 | 6.795 |
| 44910.15625 | 6.766 |
| 44910.166666666664 | 6.751 |
| 44910.177083333336 | 6.734 |
| 44910.1875 | 6.718 |
| 44910.197916666664 | 6.701 |
| 44910.208333333336 | 6.7 |
| 44910.21875 | 6.685 |
| 44910.229166666664 | 6.677 |
| 44910.239583333336 | 6.667 |
| 44910.25 | 6.653 |
| 44910.260416666664 | 6.662 |
| 44910.270833333336 | 6.663 |
| 44910.28125 | 6.629 |
| 44910.291666666664 | 6.565 |
| 44910.302083333336 | 6.541 |
| 44910.3125 | 6.409 |
| 44910.322916666664 | 6.391 |
| 44910.333333333336 | 6.263 |
| 44910.34375 | 6.201 |
| 44910.354166666664 | 6.151 |
| 44910.364583333336 | 6.087 |
| 44910.375 | 6.041 |
| 44910.385416666664 | 5.957 |
| 44910.395833333336 | 5.967 |
| 44910.40625 | 5.973 |
| 44910.416666666664 | 5.836 |
| 44910.427083333336 | 6.105 |
| 44910.4375 | 5.858 |
| 44910.447916666664 | 5.85 |
| 44910.458333333336 | 5.811 |
| 44910.46875 | 5.76 |
| 44910.479166666664 | 5.771 |
| 44910.489583333336 | 5.751 |
| 44910.5 | 5.732 |
| 44910.510416666664 | 5.703 |
| 44910.520833333336 | 5.708 |
| 44910.53125 | 5.724 |
| 44910.541666666664 | 5.798 |
| 44910.552083333336 | 5.806 |
| 44910.5625 | 5.828 |
| 44910.572916666664 | 5.925 |
| 44910.583333333336 | 5.998 |
| 44910.59375 | 6.102 |
| 44910.604166666664 | 6.306 |
| 44910.614583333336 | 6.42 |
| 44910.625 | 6.455 |
| 44910.635416666664 | 6.5 |
| 44910.645833333336 | 6.539 |
| 44910.65625 | 6.573 |
| 44910.666666666664 | 6.616 |
| 44910.677083333336 | 6.648 |
| 44910.6875 | 6.699 |
| 44910.697916666664 | 6.821 |
| 44910.708333333336 | 6.926 |
| 44910.71875 | 7.049 |
| 44910.729166666664 | 7.155 |
| 44910.739583333336 | 7.191 |
| 44910.75 | 7.211 |
| 44910.760416666664 | 7.093 |
| 44910.770833333336 | 7.01 |
| 44910.78125 | 6.978 |
| 44910.791666666664 | 7.137 |
| 44910.802083333336 | 7.075 |
| 44910.8125 | 6.936 |
| 44910.822916666664 | 6.94 |
| 44910.833333333336 | 7.038 |
| 44910.84375 | 6.975 |
| 44910.854166666664 | 7.062 |
| 44910.864583333336 | 7.15 |
| 44910.875 | 7.17 |
| 44910.885416666664 | 7.197 |
| 44910.895833333336 | 7.237 |
| 44910.90625 | 7.286 |
| 44910.916666666664 | 7.307 |
| 44910.927083333336 | 7.366 |
| 44910.9375 | 7.415 |
| 44910.947916666664 | 7.434 |
| 44910.958333333336 | 7.461 |
| 44910.96875 | 7.443 |
| 44910.979166666664 | 7.532 |
| 44910.989583333336 | 7.59 |
| 44911.0 | 7.564 |
| 44911.010416666664 | 7.777 |
| 44911.020833333336 | 7.668 |
| 44911.03125 | 7.843 |
| 44911.041666666664 | 7.943 |
| 44911.052083333336 | 7.76 |
| 44911.0625 | 7.583 |
| 44911.072916666664 | 7.535 |
| 44911.083333333336 | 7.603 |
| 44911.09375 | 7.668 |
| 44911.104166666664 | 7.716 |
| 44911.114583333336 | 7.631 |
| 44911.125 | 7.83 |
| 44911.135416666664 | 8.079 |
| 44911.145833333336 | 7.816 |
| 44911.15625 | 7.603 |
| 44911.166666666664 | 7.662 |
| 44911.177083333336 | 7.645 |
| 44911.1875 | 7.561 |
| 44911.197916666664 | 7.577 |
| 44911.208333333336 | 7.637 |
| 44911.21875 | 7.743 |
| 44911.229166666664 | 7.842 |
| 44911.239583333336 | 7.939 |
| 44911.25 | 8.028 |
| 44911.260416666664 | 8.053 |
| 44911.270833333336 | 8.067 |
| 44911.28125 | 8.074 |
| 44911.291666666664 | 8.078 |
| 44911.302083333336 | 8.023 |
| 44911.3125 | 8.049 |
| 44911.322916666664 | 8.041 |
| 44911.333333333336 | 8.019 |
| 44911.34375 | 7.998 |
| 44911.354166666664 | 7.994 |
| 44911.364583333336 | 7.966 |
| 44911.375 | 7.986 |
| 44911.385416666664 | 7.914 |
| 44911.395833333336 | 7.992 |
| 44911.40625 | 7.986 |
| 44911.416666666664 | 7.978 |
| 44911.427083333336 | 7.944 |
| 44911.4375 | 7.927 |
| 44911.447916666664 | 7.917 |
| 44911.458333333336 | 7.994 |
| 44911.46875 | 8.027 |
| 44911.479166666664 | 8.016 |
| 44911.489583333336 | 8.028 |
| 44911.5 | 7.985 |
| 44911.510416666664 | 8.017 |
| 44911.520833333336 | 7.997 |
| 44911.53125 | 7.966 |
| 44911.541666666664 | 7.945 |
| 44911.552083333336 | 7.935 |
| 44911.5625 | 7.946 |
| 44911.572916666664 | 7.956 |
| 44911.583333333336 | 7.972 |
| 44911.59375 | 8.004 |
| 44911.604166666664 | 8.026 |
| 44911.614583333336 | 8.052 |
| 44911.625 | 8.056 |
| 44911.635416666664 | 8.074 |
| 44911.645833333336 | 8.08 |
| 44911.65625 | 8.093 |
| 44911.666666666664 | 8.102 |
| 44911.677083333336 | 8.137 |
| 44911.6875 | 8.167 |
| 44911.697916666664 | 8.191 |
| 44911.708333333336 | 8.234 |
| 44911.71875 | 8.244 |
| 44911.729166666664 | 8.262 |
| 44911.739583333336 | 8.277 |
| 44911.75 | 8.305 |
| 44911.760416666664 | 8.341 |
| 44911.770833333336 | 8.374 |
| 44911.78125 | 8.409 |
| 44911.791666666664 | 8.453 |
| 44911.802083333336 | 8.467 |
| 44911.8125 | 8.483 |
| 44911.822916666664 | 8.505 |
| 44911.833333333336 | 8.524 |
| 44911.84375 | 8.536 |
| 44911.854166666664 | 8.534 |
| 44911.864583333336 | 8.552 |
| 44911.875 | 8.635 |
| 44911.885416666664 | 8.662 |
| 44911.895833333336 | 8.765 |
| 44911.90625 | 8.785 |
| 44911.916666666664 | 8.847 |
| 44911.927083333336 | 8.813 |
| 44911.9375 | 8.787 |
| 44911.947916666664 | 8.996 |
| 44911.958333333336 | 9.034 |
| 44911.96875 | 8.964 |
| 44911.979166666664 | 8.986 |
| 44911.989583333336 | 8.97 |
| 44912.0 | 8.987 |
| 44912.010416666664 | 8.896 |
| 44912.020833333336 | 8.839 |
| 44912.03125 | 8.806 |
| 44912.041666666664 | 8.791 |
| 44912.052083333336 | 8.778 |
| 44912.0625 | 8.785 |
| 44912.072916666664 | 8.769 |
| 44912.083333333336 | 8.693 |
| 44912.09375 | 8.742 |
| 44912.104166666664 | 8.699 |
| 44912.114583333336 | 8.749 |
| 44912.125 | 8.759 |
| 44912.135416666664 | 8.78 |
| 44912.145833333336 | 8.777 |
| 44912.15625 | 8.763 |
| 44912.166666666664 | 8.694 |
| 44912.177083333336 | 8.595 |
| 44912.1875 | 8.556 |
| 44912.197916666664 | 8.526 |
| 44912.208333333336 | 8.509 |
| 44912.21875 | 8.51 |
| 44912.229166666664 | 8.511 |
| 44912.239583333336 | 8.479 |
| 44912.25 | 8.429 |
| 44912.260416666664 | 8.41 |
| 44912.270833333336 | 8.393 |
| 44912.28125 | 8.378 |
| 44912.291666666664 | 8.366 |
| 44912.302083333336 | 8.356 |
| 44912.3125 | 8.339 |
| 44912.322916666664 | 8.332 |
| 44912.333333333336 | 8.318 |
| 44912.34375 | 8.29 |
| 44912.354166666664 | 8.314 |
| 44912.364583333336 | 8.319 |
| 44912.375 | 8.231 |
| 44912.385416666664 | 8.237 |
| 44912.395833333336 | 8.143 |
| 44912.40625 | 8.129 |
| 44912.416666666664 | 8.092 |
| 44912.427083333336 | 8.084 |
| 44912.4375 | 8.078 |
| 44912.447916666664 | 7.963 |
| 44912.458333333336 | 7.928 |
| 44912.46875 | 7.528 |
| 44912.479166666664 | 7.516 |
| 44912.489583333336 | 7.456 |
| 44912.5 | 7.35 |
| 44912.510416666664 | 7.301 |
| 44912.520833333336 | 7.589 |
| 44912.53125 | 7.394 |
| 44912.541666666664 | 7.544 |
| 44912.552083333336 | 7.554 |
| 44912.5625 | 7.587 |
| 44912.572916666664 | 7.576 |
| 44912.583333333336 | 7.586 |
| 44912.59375 | 7.616 |
| 44912.604166666664 | 7.63 |
| 44912.614583333336 | 7.643 |
| 44912.625 | 7.621 |
| 44912.635416666664 | 7.651 |
| 44912.645833333336 | 7.659 |
| 44912.65625 | 7.652 |
| 44912.666666666664 | 7.65 |
| 44912.677083333336 | 7.67 |
| 44912.6875 | 7.697 |
| 44912.697916666664 | 7.747 |
| 44912.708333333336 | 7.877 |
| 44912.71875 | 8.003 |
| 44912.729166666664 | 8.053 |
| 44912.739583333336 | 8.072 |
| 44912.75 | 8.11 |
| 44912.760416666664 | 8.13 |
| 44912.770833333336 | 8.145 |
| 44912.78125 | 8.171 |
| 44912.791666666664 | 8.196 |
| 44912.802083333336 | 8.226 |
| 44912.8125 | 8.239 |
| 44912.822916666664 | 8.253 |
| 44912.833333333336 | 8.267 |
| 44912.84375 | 8.281 |
| 44912.854166666664 | 8.222 |
| 44912.864583333336 | 8.239 |
| 44912.875 | 8.282 |
| 44912.885416666664 | 8.342 |
| 44912.895833333336 | 8.404 |
| 44912.90625 | 8.395 |
| 44912.916666666664 | 8.465 |
| 44912.927083333336 | 8.421 |
| 44912.9375 | 8.38 |
| 44912.947916666664 | 8.339 |
| 44912.958333333336 | 8.318 |
| 44912.96875 | 8.488 |
| 44912.979166666664 | 8.4 |
| 44912.989583333336 | 8.406 |
| 44913.0 | 8.359 |
| 44913.010416666664 | 8.323 |
| 44913.020833333336 | 8.323 |
| 44913.03125 | 8.306 |
| 44913.041666666664 | 8.231 |
| 44913.052083333336 | 8.156 |
| 44913.0625 | 8.107 |
| 44913.072916666664 | 8.1 |
| 44913.083333333336 | 8.069 |
| 44913.09375 | 8.081 |
| 44913.104166666664 | 7.971 |
| 44913.114583333336 | 8.027 |
| 44913.125 | 8.018 |
| 44913.135416666664 | 8.031 |
| 44913.145833333336 | 8.071 |
| 44913.15625 | 8.097 |
| 44913.166666666664 | 8.104 |
| 44913.177083333336 | 8.094 |
| 44913.1875 | 8.098 |
| 44913.197916666664 | 8.084 |
| 44913.208333333336 | 8.001 |
| 44913.21875 | 7.93 |
| 44913.229166666664 | 7.888 |
| 44913.239583333336 | 7.874 |
| 44913.25 | 7.853 |
| 44913.260416666664 | 7.825 |
| 44913.270833333336 | 7.788 |
| 44913.28125 | 7.76 |
| 44913.291666666664 | 7.745 |
| 44913.302083333336 | 7.736 |
| 44913.3125 | 7.728 |
| 44913.322916666664 | 7.714 |
| 44913.333333333336 | 7.696 |
| 44913.34375 | 7.685 |
| 44913.354166666664 | 7.678 |
| 44913.364583333336 | 7.677 |
| 44913.375 | 7.683 |
| 44913.385416666664 | 7.683 |
| 44913.395833333336 | 7.702 |
| 44913.40625 | 7.701 |
| 44913.416666666664 | 7.621 |
| 44913.427083333336 | 7.553 |
| 44913.4375 | 7.461 |
| 44913.447916666664 | 7.332 |
| 44913.458333333336 | 7.219 |
| 44913.46875 | 7.124 |
| 44913.479166666664 | 7.037 |
| 44913.489583333336 | 7.049 |
| 44913.5 | 6.647 |
| 44913.510416666664 | 6.67 |
| 44913.520833333336 | 6.609 |
| 44913.53125 | 6.497 |
| 44913.541666666664 | 6.537 |
| 44913.552083333336 | 6.57 |
| 44913.5625 | 6.548 |
| 44913.572916666664 | 6.538 |
| 44913.583333333336 | 6.543 |
| 44913.59375 | 6.568 |
| 44913.604166666664 | 6.605 |
| 44913.614583333336 | 6.633 |
| 44913.625 | 6.664 |
| 44913.635416666664 | 6.698 |
| 44913.645833333336 | 6.755 |
| 44913.65625 | 6.769 |
| 44913.666666666664 | 6.722 |
| 44913.677083333336 | 6.751 |
| 44913.6875 | 6.789 |
| 44913.697916666664 | 6.821 |
| 44913.708333333336 | 6.865 |
| 44913.71875 | 6.958 |
| 44913.729166666664 | 7.087 |
| 44913.739583333336 | 7.217 |
| 44913.75 | 7.327 |
| 44913.760416666664 | 7.418 |
| 44913.770833333336 | 7.506 |
| 44913.78125 | 7.575 |
| 44913.791666666664 | 7.62 |
| 44913.802083333336 | 7.649 |
| 44913.8125 | 7.683 |
| 44913.822916666664 | 7.712 |
| 44913.833333333336 | 7.725 |
| 44913.84375 | 7.758 |
| 44913.854166666664 | 7.784 |
| 44913.864583333336 | 7.811 |
| 44913.875 | 7.818 |
| 44913.885416666664 | 7.822 |
| 44913.895833333336 | 7.815 |
| 44913.90625 | 7.792 |
| 44913.916666666664 | 7.936 |
| 44913.927083333336 | 7.825 |
| 44913.9375 | 7.757 |
| 44913.947916666664 | 7.76 |
| 44913.958333333336 | 7.722 |
| 44913.96875 | 7.676 |
| 44913.979166666664 | 7.564 |
| 44913.989583333336 | 7.491 |
| 44914.0 | 7.411 |
| 44914.010416666664 | 7.439 |
| 44914.020833333336 | 7.301 |
| 44914.03125 | 7.173 |
| 44914.041666666664 | 7.051 |
| 44914.052083333336 | 7.03 |
| 44914.0625 | 7 |
| 44914.072916666664 | 6.983 |
| 44914.083333333336 | 6.92 |
| 44914.09375 | 6.841 |
| 44914.104166666664 | 6.781 |
| 44914.114583333336 | 6.761 |
| 44914.125 | 6.736 |
| 44914.135416666664 | 6.722 |
| 44914.145833333336 | 6.714 |
| 44914.15625 | 6.631 |
| 44914.166666666664 | 6.717 |
| 44914.177083333336 | 6.73 |
| 44914.1875 | 6.756 |
| 44914.197916666664 | 6.738 |
| 44914.208333333336 | 6.786 |
| 44914.21875 | 6.793 |
| 44914.229166666664 | 6.766 |
| 44914.239583333336 | 6.727 |
| 44914.25 | 6.706 |
| 44914.260416666664 | 6.621 |
| 44914.270833333336 | 6.584 |
| 44914.28125 | 6.539 |
| 44914.291666666664 | 6.497 |
| 44914.302083333336 | 6.485 |
| 44914.3125 | 6.465 |
| 44914.322916666664 | 6.452 |
| 44914.333333333336 | 6.451 |
| 44914.34375 | 6.439 |
| 44914.354166666664 | 6.424 |
| 44914.364583333336 | 6.428 |
| 44914.375 | 6.443 |
| 44914.385416666664 | 6.464 |
| 44914.395833333336 | 6.492 |
| 44914.40625 | 6.511 |
| 44914.416666666664 | 6.504 |
| 44914.427083333336 | 6.442 |
| 44914.4375 | 6.429 |
| 44914.447916666664 | 6.422 |
| 44914.458333333336 | 6.361 |
| 44914.46875 | 6.182 |
| 44914.479166666664 | 6.12 |
| 44914.489583333336 | 5.919 |
| 44914.5 | 5.673 |
| 44914.510416666664 | 5.421 |
| 44914.520833333336 | 5.405 |
| 44914.53125 | 5.11 |
| 44914.541666666664 | 4.909 |
| 44914.552083333336 | 4.951 |
| 44914.5625 | 4.762 |
| 44914.572916666664 | 4.792 |
| 44914.583333333336 | 4.959 |
| 44914.59375 | 4.975 |
| 44914.604166666664 | 4.974 |
| 44914.614583333336 | 4.946 |
| 44914.625 | 4.896 |
| 44914.635416666664 | 4.86 |
| 44914.645833333336 | 4.866 |
| 44914.65625 | 4.872 |
| 44914.666666666664 | 4.876 |
| 44914.677083333336 | 4.918 |
| 44914.6875 | 4.94 |
| 44914.697916666664 | 5.034 |
| 44914.708333333336 | 5.073 |
| 44914.71875 | 5.122 |
| 44914.729166666664 | 5.174 |
| 44914.739583333336 | 5.246 |
| 44914.75 | 5.388 |
| 44914.760416666664 | 5.478 |
| 44914.770833333336 | 5.597 |
| 44914.78125 | 5.769 |
| 44914.791666666664 | 5.917 |
| 44914.802083333336 | 6.003 |
| 44914.8125 | 6.021 |
| 44914.822916666664 | 6.051 |
| 44914.833333333336 | 6.102 |
| 44914.84375 | 6.167 |
| 44914.854166666664 | 6.261 |
| 44914.864583333336 | 6.329 |
| 44914.875 | 6.392 |
| 44914.885416666664 | 6.44 |
| 44914.895833333336 | 6.476 |
| 44914.90625 | 6.506 |
| 44914.916666666664 | 6.531 |
| 44914.927083333336 | 6.535 |
| 44914.9375 | 6.637 |
| 44914.947916666664 | 6.51 |
| 44914.958333333336 | 6.488 |
| 44914.96875 | 6.306 |
| 44914.979166666664 | 6.25 |
| 44914.989583333336 | 6.214 |
| 44915.0 | 6.11 |
| 44915.010416666664 | 6.117 |
| 44915.020833333336 | 6.022 |
| 44915.03125 | 5.865 |
| 44915.041666666664 | 5.638 |
| 44915.052083333336 | 5.555 |
| 44915.0625 | 5.428 |
| 44915.072916666664 | 5.403 |
| 44915.083333333336 | 5.365 |
| 44915.09375 | 5.301 |
| 44915.104166666664 | 5.243 |
| 44915.114583333336 | 5.212 |
| 44915.125 | 5.169 |
| 44915.135416666664 | 5.158 |
| 44915.145833333336 | 5.109 |
| 44915.15625 | 5.066 |
| 44915.166666666664 | 5.103 |
| 44915.177083333336 | 5.058 |
| 44915.1875 | 5.031 |
| 44915.197916666664 | 5.058 |
| 44915.208333333336 | 5.093 |
| 44915.21875 | 5.105 |
| 44915.229166666664 | 5.13 |
| 44915.239583333336 | 5.173 |
| 44915.25 | 5.279 |
| 44915.260416666664 | 5.369 |
| 44915.270833333336 | 5.35 |
| 44915.28125 | 5.291 |
| 44915.291666666664 | 5.175 |
| 44915.302083333336 | 5.165 |
| 44915.3125 | 5.165 |
| 44915.322916666664 | 5.153 |
| 44915.333333333336 | 5.154 |
| 44915.34375 | 5.151 |
| 44915.354166666664 | 5.157 |
| 44915.364583333336 | 5.184 |
| 44915.375 | 5.248 |
| 44915.385416666664 | 5.312 |
| 44915.395833333336 | 5.358 |
| 44915.40625 | 5.382 |
| 44915.416666666664 | 5.396 |
| 44915.427083333336 | 5.395 |
| 44915.4375 | 5.382 |
| 44915.447916666664 | 5.359 |
| 44915.458333333336 | 5.321 |
| 44915.46875 | 5.302 |
| 44915.479166666664 | 5.235 |
| 44915.489583333336 | 5.149 |
| 44915.5 | 4.998 |
| 44915.510416666664 | 4.919 |
| 44915.520833333336 | 4.805 |
| 44915.53125 | 4.617 |
| 44915.541666666664 | 4.523 |
| 44915.552083333336 | 4.496 |
| 44915.5625 | 4.285 |
| 44915.572916666664 | 4.032 |
| 44915.583333333336 | 3.798 |
| 44915.59375 | 3.736 |
| 44915.604166666664 | 3.755 |
| 44915.614583333336 | 3.785 |
| 44915.625 | 3.954 |
| 44915.635416666664 | 3.972 |
| 44915.645833333336 | 4.087 |
| 44915.65625 | 4.049 |
| 44915.666666666664 | 4.058 |
| 44915.677083333336 | 4.083 |
| 44915.6875 | 4.122 |
| 44915.697916666664 | 4.181 |
| 44915.708333333336 | 4.229 |
| 44915.71875 | 4.289 |
| 44915.729166666664 | 4.338 |
| 44915.739583333336 | 4.369 |
| 44915.75 | 4.377 |
| 44915.760416666664 | 4.364 |
| 44915.770833333336 | 4.385 |
| 44915.78125 | 4.449 |
| 44915.791666666664 | 4.543 |
| 44915.802083333336 | 4.713 |
| 44915.8125 | 4.87 |
| 44915.822916666664 | 4.945 |
| 44915.833333333336 | 5.061 |
| 44915.84375 | 5.183 |
| 44915.854166666664 | 5.274 |
| 44915.864583333336 | 5.343 |
| 44915.875 | 5.439 |
| 44915.885416666664 | 5.529 |
| 44915.895833333336 | 5.617 |
| 44915.90625 | 5.684 |
| 44915.916666666664 | 5.72 |
| 44915.927083333336 | 5.748 |
| 44915.9375 | 5.755 |
| 44915.947916666664 | 5.765 |
| 44915.958333333336 | 5.774 |
| 44915.96875 | 5.705 |
| 44915.979166666664 | 5.669 |
| 44915.989583333336 | 5.595 |
| 44916.0 | 5.463 |
| 44916.010416666664 | 5.482 |
| 44916.020833333336 | 5.334 |
| 44916.03125 | 5.341 |
| 44916.041666666664 | 5.191 |
| 44916.052083333336 | 5.147 |
| 44916.0625 | 4.976 |
| 44916.072916666664 | 4.788 |
| 44916.083333333336 | 4.779 |
| 44916.09375 | 4.778 |
| 44916.104166666664 | 4.712 |
| 44916.114583333336 | 4.693 |
| 44916.125 | 4.669 |
| 44916.135416666664 | 4.639 |
| 44916.145833333336 | 4.567 |
| 44916.15625 | 4.539 |
| 44916.166666666664 | 4.495 |
| 44916.177083333336 | 4.491 |
| 44916.1875 | 4.453 |
| 44916.197916666664 | 4.474 |
| 44916.208333333336 | 4.418 |
| 44916.21875 | 4.416 |
| 44916.229166666664 | 4.434 |
| 44916.239583333336 | 4.483 |
| 44916.25 | 4.501 |
| 44916.260416666664 | 4.535 |
| 44916.270833333336 | 4.572 |
| 44916.28125 | 4.653 |
| 44916.291666666664 | 4.694 |
| 44916.302083333336 | 4.714 |
| 44916.3125 | 4.727 |
| 44916.322916666664 | 4.714 |
| 44916.333333333336 | 4.697 |
| 44916.34375 | 4.696 |
| 44916.354166666664 | 4.696 |
| 44916.364583333336 | 4.702 |
| 44916.375 | 4.747 |
| 44916.385416666664 | 4.766 |
| 44916.395833333336 | 4.793 |
| 44916.40625 | 4.824 |
| 44916.416666666664 | 4.843 |
| 44916.427083333336 | 4.842 |
| 44916.4375 | 4.832 |
| 44916.447916666664 | 4.813 |
| 44916.458333333336 | 4.789 |
| 44916.46875 | 4.78 |
| 44916.479166666664 | 4.765 |
| 44916.489583333336 | 4.752 |
| 44916.5 | 4.744 |
| 44916.510416666664 | 4.745 |
| 44916.520833333336 | 4.727 |
| 44916.53125 | 4.58 |
| 44916.541666666664 | 4.483 |
| 44916.552083333336 | 4.392 |
| 44916.5625 | 4.304 |
| 44916.572916666664 | 4.234 |
| 44916.583333333336 | 4.152 |
| 44916.59375 | 4.164 |
| 44916.604166666664 | 4.026 |
| 44916.614583333336 | 4.009 |
| 44916.625 | 4.112 |
| 44916.635416666664 | 4.155 |
| 44916.645833333336 | 4.168 |
| 44916.65625 | 4.439 |
| 44916.666666666664 | 4.341 |
| 44916.677083333336 | 4.457 |
| 44916.6875 | 4.526 |
| 44916.697916666664 | 4.652 |
| 44916.708333333336 | 4.77 |
| 44916.71875 | 4.707 |
| 44916.729166666664 | 4.745 |
| 44916.739583333336 | 4.761 |
| 44916.75 | 4.775 |
| 44916.760416666664 | 4.835 |
| 44916.770833333336 | 4.885 |
| 44916.78125 | 4.915 |
| 44916.791666666664 | 4.916 |
| 44916.802083333336 | 4.921 |
| 44916.8125 | 4.963 |
| 44916.822916666664 | 5.001 |
| 44916.833333333336 | 5.08 |
| 44916.84375 | 5.214 |
| 44916.854166666664 | 5.324 |
| 44916.864583333336 | 5.363 |
| 44916.875 | 5.391 |
| 44916.885416666664 | 5.454 |
| 44916.895833333336 | 5.493 |
| 44916.90625 | 5.581 |
| 44916.916666666664 | 5.621 |
| 44916.927083333336 | 5.639 |
| 44916.9375 | 5.631 |
| 44916.947916666664 | 5.629 |
| 44916.958333333336 | 5.628 |
| 44916.96875 | 5.622 |
| 44916.979166666664 | 5.609 |
| 44916.989583333336 | 5.597 |
| 44917.0 | 5.609 |
| 44917.010416666664 | 5.606 |
| 44917.020833333336 | 5.571 |
| 44917.03125 | 5.516 |
| 44917.041666666664 | 5.516 |
| 44917.052083333336 | 5.455 |
| 44917.0625 | 5.404 |
| 44917.072916666664 | 5.351 |
| 44917.083333333336 | 5.265 |
| 44917.09375 | 5.157 |
| 44917.104166666664 | 5.105 |
| 44917.114583333336 | 5.001 |
| 44917.125 | 4.824 |
| 44917.135416666664 | 4.806 |
| 44917.145833333336 | 4.792 |
| 44917.15625 | 4.883 |
| 44917.166666666664 | 4.944 |
| 44917.177083333336 | 4.905 |
| 44917.1875 | 4.913 |
| 44917.197916666664 | 4.913 |
| 44917.208333333336 | 4.929 |
| 44917.21875 | 4.945 |
| 44917.229166666664 | 4.974 |
| 44917.239583333336 | 4.955 |
| 44917.25 | 4.958 |
| 44917.260416666664 | 4.939 |
| 44917.270833333336 | 4.935 |
| 44917.28125 | 4.959 |
| 44917.291666666664 | 4.968 |
| 44917.302083333336 | 4.968 |
| 44917.3125 | 4.962 |
| 44917.322916666664 | 4.985 |
| 44917.333333333336 | 5.008 |
| 44917.34375 | 5.028 |
| 44917.354166666664 | 5.041 |
| 44917.364583333336 | 5.046 |
| 44917.375 | 5.062 |
| 44917.385416666664 | 5.078 |
| 44917.395833333336 | 5.092 |
| 44917.40625 | 5.117 |
| 44917.416666666664 | 5.118 |
| 44917.427083333336 | 5.102 |
| 44917.4375 | 5.124 |
| 44917.447916666664 | 5.168 |
| 44917.458333333336 | 5.195 |
| 44917.46875 | 5.186 |
| 44917.479166666664 | 5.163 |
| 44917.489583333336 | 5.137 |
| 44917.5 | 5.128 |
| 44917.510416666664 | 5.133 |
| 44917.520833333336 | 5.143 |
| 44917.53125 | 5.152 |
| 44917.541666666664 | 5.174 |
| 44917.552083333336 | 5.193 |
| 44917.5625 | 5.211 |
| 44917.572916666664 | 5.234 |
| 44917.583333333336 | 5.269 |
| 44917.59375 | 5.294 |
| 44917.604166666664 | 5.345 |
| 44917.614583333336 | 5.382 |
| 44917.625 | 5.437 |
| 44917.635416666664 | 5.517 |
| 44917.645833333336 | 5.572 |
| 44917.65625 | 5.598 |
| 44917.666666666664 | 5.686 |
| 44917.677083333336 | 5.735 |
| 44917.6875 | 5.802 |
| 44917.697916666664 | 5.909 |
| 44917.708333333336 | 6.015 |
| 44917.71875 | 6.118 |
| 44917.729166666664 | 6.169 |
| 44917.739583333336 | 6.137 |
| 44917.75 | 6.178 |
| 44917.760416666664 | 6.164 |
| 44917.770833333336 | 6.186 |
| 44917.78125 | 6.163 |
| 44917.791666666664 | 6.156 |
| 44917.802083333336 | 6.147 |
| 44917.8125 | 6.174 |
| 44917.822916666664 | 6.217 |
| 44917.833333333336 | 6.221 |
| 44917.84375 | 6.224 |
| 44917.854166666664 | 6.221 |
| 44917.864583333336 | 6.253 |
| 44917.875 | 6.271 |
| 44917.885416666664 | 6.312 |
| 44917.895833333336 | 6.346 |
| 44917.90625 | 6.357 |
| 44917.916666666664 | 6.386 |
| 44917.927083333336 | 6.385 |
| 44917.9375 | 6.387 |
| 44917.947916666664 | 6.396 |
| 44917.958333333336 | 6.402 |
| 44917.96875 | 6.408 |
| 44917.979166666664 | 6.407 |
| 44917.989583333336 | 6.405 |
| 44918.0 | 6.408 |
| 44918.010416666664 | 6.41 |
| 44918.020833333336 | 6.419 |
| 44918.03125 | 6.447 |
| 44918.041666666664 | 6.458 |
| 44918.052083333336 | 6.482 |
| 44918.0625 | 6.571 |
| 44918.072916666664 | 6.577 |
| 44918.083333333336 | 6.599 |
| 44918.09375 | 6.699 |
| 44918.104166666664 | 6.821 |
| 44918.114583333336 | 6.934 |
| 44918.125 | 7.066 |
| 44918.135416666664 | 7.225 |
| 44918.145833333336 | 7.334 |
| 44918.15625 | 7.428 |
| 44918.166666666664 | 7.536 |
| 44918.177083333336 | 7.691 |
| 44918.1875 | 7.668 |
| 44918.197916666664 | 7.904 |
| 44918.208333333336 | 7.859 |
| 44918.21875 | 7.945 |
| 44918.229166666664 | 7.835 |
| 44918.239583333336 | 7.89 |
| 44918.25 | 7.952 |
| 44918.260416666664 | 7.978 |
| 44918.270833333336 | 7.976 |
| 44918.28125 | 7.964 |
| 44918.291666666664 | 7.982 |
| 44918.302083333336 | 7.951 |
| 44918.3125 | 7.933 |
| 44918.322916666664 | 7.918 |
| 44918.333333333336 | 7.889 |
| 44918.34375 | 7.872 |
| 44918.354166666664 | 7.799 |
| 44918.364583333336 | 7.728 |
| 44918.375 | 7.714 |
| 44918.385416666664 | 7.7 |
| 44918.395833333336 | 7.686 |
| 44918.40625 | 7.685 |
| 44918.416666666664 | 7.651 |
| 44918.427083333336 | 7.571 |
| 44918.4375 | 7.489 |
| 44918.447916666664 | 7.417 |
| 44918.458333333336 | 7.388 |
| 44918.46875 | 7.376 |
| 44918.479166666664 | 7.383 |
| 44918.489583333336 | 7.4 |
| 44918.5 | 7.426 |
| 44918.510416666664 | 7.452 |
| 44918.520833333336 | 7.471 |
| 44918.53125 | 7.488 |
| 44918.541666666664 | 7.506 |
| 44918.552083333336 | 7.52 |
| 44918.5625 | 7.53 |
| 44918.572916666664 | 7.542 |
| 44918.583333333336 | 7.518 |
| 44918.59375 | 7.559 |
| 44918.604166666664 | 7.596 |
| 44918.614583333336 | 7.62 |
| 44918.625 | 7.672 |
| 44918.635416666664 | 7.704 |
| 44918.645833333336 | 7.721 |
| 44918.65625 | 7.733 |
| 44918.666666666664 | 7.773 |
| 44918.677083333336 | 7.794 |
| 44918.6875 | 7.813 |
| 44918.697916666664 | 7.867 |
| 44918.708333333336 | 7.879 |
| 44918.71875 | 7.926 |
| 44918.729166666664 | 8.003 |
| 44918.739583333336 | 8.044 |
| 44918.75 | 8.157 |
| 44918.760416666664 | 8.16 |
| 44918.770833333336 | 8.224 |
| 44918.78125 | 8.249 |
| 44918.791666666664 | 8.286 |
| 44918.802083333336 | 8.283 |
| 44918.8125 | 8.256 |
| 44918.822916666664 | 8.218 |
| 44918.833333333336 | 8.193 |
| 44918.84375 | 8.134 |
| 44918.854166666664 | 8.071 |
| 44918.864583333336 | 8.032 |
| 44918.875 | 8.025 |
| 44918.885416666664 | 8.035 |
| 44918.895833333336 | 7.998 |
| 44918.90625 | 7.726 |
| 44918.916666666664 | 7.505 |
| 44918.927083333336 | 7.354 |
| 44918.9375 | 7.093 |
| 44918.947916666664 | 6.824 |
| 44918.958333333336 | 6.466 |
| 44918.96875 | 6.183 |
| 44918.979166666664 | 5.987 |
| 44918.989583333336 | 5.797 |
| 44919.0 | 5.69 |
| 44919.010416666664 | 5.643 |
| 44919.020833333336 | 5.604 |
| 44919.03125 | 5.635 |
| 44919.041666666664 | 5.749 |
| 44919.052083333336 | 5.85 |
| 44919.0625 | 5.873 |
| 44919.072916666664 | 5.838 |
| 44919.083333333336 | 5.754 |
| 44919.09375 | 5.5 |
| 44919.104166666664 | 5.38 |
| 44919.114583333336 | 5.139 |
| 44919.125 | 5.02 |
| 44919.135416666664 | 5.084 |
| 44919.145833333336 | 4.836 |
| 44919.15625 | 4.655 |
| 44919.166666666664 | 4.328 |
| 44919.177083333336 | 4.55 |
| 44919.1875 | 4.798 |
| 44919.197916666664 | 4.525 |
| 44919.208333333336 | 4.094 |
| 44919.21875 | 3.736 |
| 44919.229166666664 | 3.518 |
| 44919.239583333336 | 3.314 |
| 44919.25 | 3.218 |
| 44919.260416666664 | 3.123 |
| 44919.270833333336 | 3.001 |
| 44919.28125 | 2.916 |
| 44919.291666666664 | 2.885 |
| 44919.302083333336 | 2.83 |
| 44919.3125 | 2.853 |
| 44919.322916666664 | 2.805 |
| 44919.333333333336 | 2.675 |
| 44919.34375 | 2.604 |
| 44919.354166666664 | 2.721 |
| 44919.364583333336 | 2.745 |
| 44919.375 | 2.711 |
| 44919.385416666664 | 2.613 |
| 44919.395833333336 | 2.579 |
| 44919.40625 | 2.431 |
| 44919.416666666664 | 2.165 |
| 44919.427083333336 | 1.691 |
| 44919.4375 | 0.829 |
| 44919.447916666664 | 0.432 |
| 44919.458333333336 | 0.02 |
| 44919.46875 | -0.053 |
| 44919.479166666664 | 0.305 |
| 44919.489583333336 | 0.723 |
| 44919.5 | 1.109 |
| 44919.510416666664 | 1.503 |
| 44919.520833333336 | 1.89 |
| 44919.53125 | 2.118 |
| 44919.541666666664 | 2.287 |
| 44919.552083333336 | 2.379 |
| 44919.5625 | 2.495 |
| 44919.572916666664 | 2.579 |
| 44919.583333333336 | 2.665 |
| 44919.59375 | 2.671 |
| 44919.604166666664 | 2.758 |
| 44919.614583333336 | 2.491 |
| 44919.625 | 2.678 |
| 44919.635416666664 | 2.278 |
| 44919.645833333336 | 1.876 |
| 44919.65625 | 1.145 |
| 44919.666666666664 | 0.866 |
| 44919.677083333336 | 0.532 |
| 44919.6875 | 0.612 |
| 44919.697916666664 | 0.553 |
| 44919.708333333336 | 0.327 |
| 44919.71875 | 0.162 |
| 44919.729166666664 | 0.596 |
| 44919.739583333336 | 0.214 |
| 44919.75 | 0.126 |
| 44919.760416666664 | 0.233 |
| 44919.770833333336 | 0.282 |
| 44919.78125 | 0.327 |
| 44919.791666666664 | 0.344 |
| 44919.802083333336 | 0.365 |
| 44919.8125 | 0.391 |
| 44919.822916666664 | 0.425 |
| 44919.833333333336 | 0.405 |
| 44919.84375 | 0.389 |
| 44919.854166666664 | 0.466 |
| 44919.864583333336 | 0.363 |
| 44919.875 | 0.381 |
| 44919.885416666664 | 0.352 |
| 44919.895833333336 | 0.344 |
| 44919.90625 | 0.342 |
| 44919.916666666664 | 0.327 |
| 44919.927083333336 | 0.362 |
| 44919.9375 | 0.415 |
| 44919.947916666664 | 0.467 |
| 44919.958333333336 | 0.48 |
| 44919.96875 | 0.353 |
| 44919.979166666664 | 0.16 |
| 44919.989583333336 | 0.128 |
| 44920.0 | -0.019 |
| 44920.010416666664 | 0.071 |
| 44920.020833333336 | 0.113 |
| 44920.03125 | 0.274 |
| 44920.041666666664 | 0.541 |
| 44920.052083333336 | 0.718 |
| 44920.0625 | 0.897 |
| 44920.072916666664 | 1.064 |
| 44920.083333333336 | 1.163 |
| 44920.09375 | 1.214 |
| 44920.104166666664 | 1.167 |
| 44920.114583333336 | 1.028 |
| 44920.125 | 1.1 |
| 44920.135416666664 | 0.816 |
| 44920.145833333336 | 0.452 |
| 44920.15625 | 0.699 |
| 44920.166666666664 | 0.768 |
| 44920.177083333336 | 0.51 |
| 44920.1875 | 0.127 |
| 44920.197916666664 | -0.239 |
| 44920.208333333336 | -0.415 |
| 44920.21875 | -0.552 |
| 44920.229166666664 | -0.748 |
| 44920.239583333336 | -0.869 |
| 44920.25 | -0.923 |
| 44920.260416666664 | -0.969 |
| 44920.270833333336 | -0.965 |
| 44920.28125 | -0.965 |
| 44920.291666666664 | -1 |
| 44920.302083333336 | -0.997 |
| 44920.3125 | -1.034 |
| 44920.322916666664 | -1.009 |
| 44920.333333333336 | -1.043 |
| 44920.34375 | -1.008 |
| 44920.354166666664 | -1.048 |
| 44920.364583333336 | -1.057 |
| 44920.375 | -1.083 |
| 44920.385416666664 | -1.055 |
| 44920.395833333336 | -1.028 |
| 44920.40625 | -1.023 |
| 44920.416666666664 | -1.048 |
| 44920.427083333336 | -0.983 |
| 44920.4375 | -0.923 |
| 44920.447916666664 | -0.892 |
| 44920.458333333336 | -0.905 |
| 44920.46875 | -1.061 |
| 44920.479166666664 | -1.164 |
| 44920.489583333336 | -1.141 |
| 44920.5 | -1.013 |
| 44920.510416666664 | -0.693 |
| 44920.520833333336 | -0.352 |
| 44920.53125 | -0.101 |
| 44920.541666666664 | 0.243 |
| 44920.552083333336 | 0.419 |
| 44920.5625 | 0.603 |
| 44920.572916666664 | 0.636 |
| 44920.583333333336 | 0.507 |
| 44920.59375 | 0.331 |
| 44920.604166666664 | 0.291 |
| 44920.614583333336 | 0.328 |
| 44920.625 | 0.362 |
| 44920.635416666664 | 0.42 |
| 44920.645833333336 | 0.48 |
| 44920.65625 | 0.487 |
| 44920.666666666664 | 0.536 |
| 44920.677083333336 | 0.604 |
| 44920.6875 | 0.558 |
| 44920.697916666664 | 0.482 |
| 44920.708333333336 | 0.45 |
| 44920.71875 | 0.39 |
| 44920.729166666664 | 0.448 |
| 44920.739583333336 | 0.45 |
| 44920.75 | 0.462 |
| 44920.760416666664 | 0.382 |
| 44920.770833333336 | 0.418 |
| 44920.78125 | 0.219 |
| 44920.791666666664 | 0.4 |
| 44920.802083333336 | 0.284 |
| 44920.8125 | 0.429 |
| 44920.822916666664 | 0.221 |
| 44920.833333333336 | 0.232 |
| 44920.84375 | 0.317 |
| 44920.854166666664 | 0.348 |
| 44920.864583333336 | 0.278 |
| 44920.875 | 0.375 |
| 44920.885416666664 | 0.376 |
| 44920.895833333336 | 0.331 |
| 44920.90625 | 0.273 |
| 44920.916666666664 | 0.318 |
| 44920.927083333336 | 0.241 |
| 44920.9375 | 0.205 |
| 44920.947916666664 | 0.165 |
| 44920.958333333336 | 0.209 |
| 44920.96875 | 0.314 |
| 44920.979166666664 | 0.342 |
| 44920.989583333336 | 0.384 |
| 44921.0 | 0.378 |
| 44921.010416666664 | 0.352 |
| 44921.020833333336 | 0.296 |
| 44921.03125 | 0.291 |
| 44921.041666666664 | 0.291 |
| 44921.052083333336 | 0.349 |
| 44921.0625 | 0.422 |
| 44921.072916666664 | 0.54 |
| 44921.083333333336 | 0.649 |
| 44921.09375 | 0.766 |
| 44921.104166666664 | 0.824 |
| 44921.114583333336 | 0.932 |
| 44921.125 | 1.008 |
| 44921.135416666664 | 0.989 |
| 44921.145833333336 | 1.133 |
| 44921.15625 | 1.001 |
| 44921.166666666664 | 1.034 |
| 44921.177083333336 | 0.749 |
| 44921.1875 | 0.564 |
| 44921.197916666664 | 0.49 |
| 44921.208333333336 | 0.532 |
| 44921.21875 | 0.535 |
| 44921.229166666664 | 0.298 |
| 44921.239583333336 | -0.035 |
| 44921.25 | -0.241 |
| 44921.260416666664 | -0.379 |
| 44921.270833333336 | -0.461 |
| 44921.28125 | -0.589 |
| 44921.291666666664 | -0.587 |
| 44921.302083333336 | -0.588 |
| 44921.3125 | -0.602 |
| 44921.322916666664 | -0.579 |
| 44921.333333333336 | -0.622 |
| 44921.34375 | -0.673 |
| 44921.354166666664 | -0.655 |
| 44921.364583333336 | -0.716 |
| 44921.375 | -0.679 |
| 44921.385416666664 | -0.717 |
| 44921.395833333336 | -0.76 |
| 44921.40625 | -0.76 |
| 44921.416666666664 | -0.736 |
| 44921.427083333336 | -0.711 |
| 44921.4375 | -0.701 |
| 44921.447916666664 | -0.705 |
| 44921.458333333336 | -0.662 |
| 44921.46875 | -0.636 |
| 44921.479166666664 | -0.614 |
| 44921.489583333336 | -0.73 |
| 44921.5 | -0.823 |
| 44921.510416666664 | -0.849 |
| 44921.520833333336 | -0.86 |
| 44921.53125 | -0.761 |
| 44921.541666666664 | -0.645 |
| 44921.552083333336 | -0.504 |
| 44921.5625 | -0.246 |
| 44921.572916666664 | 0.054 |
| 44921.583333333336 | 0.258 |
| 44921.59375 | 0.446 |
| 44921.604166666664 | 0.53 |
| 44921.614583333336 | 0.533 |
| 44921.625 | 0.485 |
| 44921.635416666664 | 0.512 |
| 44921.645833333336 | 0.543 |
| 44921.65625 | 0.565 |
| 44921.666666666664 | 0.584 |
| 44921.677083333336 | 0.58 |
| 44921.6875 | 0.661 |
| 44921.697916666664 | 0.729 |
| 44921.708333333336 | 0.774 |
| 44921.71875 | 0.763 |
| 44921.729166666664 | 0.827 |
| 44921.739583333336 | 0.801 |
| 44921.75 | 0.809 |
| 44921.760416666664 | 0.853 |
| 44921.770833333336 | 0.851 |
| 44921.78125 | 0.913 |
| 44921.791666666664 | 0.874 |
| 44921.802083333336 | 0.883 |
| 44921.8125 | 0.773 |
| 44921.822916666664 | 0.721 |
| 44921.833333333336 | 0.704 |
| 44921.84375 | 0.682 |
| 44921.854166666664 | 0.618 |
| 44921.864583333336 | 0.609 |
| 44921.875 | 0.566 |
| 44921.885416666664 | 0.573 |
| 44921.895833333336 | 0.612 |
| 44921.90625 | 0.662 |
| 44921.916666666664 | 0.697 |
| 44921.927083333336 | 0.658 |
| 44921.9375 | 0.597 |
| 44921.947916666664 | 0.603 |
| 44921.958333333336 | 0.595 |
| 44921.96875 | 0.531 |
| 44921.979166666664 | 0.521 |
| 44921.989583333336 | 0.542 |
| 44922.0 | 0.601 |
| 44922.010416666664 | 0.624 |
| 44922.020833333336 | 0.657 |
| 44922.03125 | 0.652 |
| 44922.041666666664 | 0.618 |
| 44922.052083333336 | 0.645 |
| 44922.0625 | 0.671 |
| 44922.072916666664 | 0.729 |
| 44922.083333333336 | 0.8 |
| 44922.09375 | 0.845 |
| 44922.104166666664 | 0.907 |
| 44922.114583333336 | 0.995 |
| 44922.125 | 1.072 |
| 44922.135416666664 | 1.22 |
| 44922.145833333336 | 1.34 |
| 44922.15625 | 1.469 |
| 44922.166666666664 | 1.502 |
| 44922.177083333336 | 1.518 |
| 44922.1875 | 1.383 |
| 44922.197916666664 | 1.401 |
| 44922.208333333336 | 1.367 |
| 44922.21875 | 1.16 |
| 44922.229166666664 | 1.191 |
| 44922.239583333336 | 1.166 |
| 44922.25 | 1.007 |
| 44922.260416666664 | 0.903 |
| 44922.270833333336 | 0.914 |
| 44922.28125 | 0.558 |
| 44922.291666666664 | 0.216 |
| 44922.302083333336 | 0.073 |
| 44922.3125 | 0.069 |
| 44922.322916666664 | 0.095 |
| 44922.333333333336 | 0.051 |
| 44922.34375 | 0.003 |
| 44922.354166666664 | -0.005 |
| 44922.364583333336 | 0.009 |
| 44922.375 | 0.002 |
| 44922.385416666664 | -0.068 |
| 44922.395833333336 | -0.033 |
| 44922.40625 | -0.069 |
| 44922.416666666664 | -0.053 |
| 44922.427083333336 | -0.05 |
| 44922.4375 | -0.043 |
| 44922.447916666664 | -0.023 |
| 44922.458333333336 | -0.019 |
| 44922.46875 | -0.01 |
| 44922.479166666664 | -0.005 |
| 44922.489583333336 | 0.026 |
| 44922.5 | 0.088 |
| 44922.510416666664 | 0.168 |
| 44922.520833333336 | 0.209 |
| 44922.53125 | 0.28 |
| 44922.541666666664 | 0.331 |
| 44922.552083333336 | 0.388 |
| 44922.5625 | 0.491 |
| 44922.572916666664 | 0.627 |
| 44922.583333333336 | 0.722 |
| 44922.59375 | 0.853 |
| 44922.604166666664 | 1.002 |
| 44922.614583333336 | 1.195 |
| 44922.625 | 1.409 |
| 44922.635416666664 | 1.606 |
| 44922.645833333336 | 1.682 |
| 44922.65625 | 1.615 |
| 44922.666666666664 | 1.535 |
| 44922.677083333336 | 1.525 |
| 44922.6875 | 1.523 |
| 44922.697916666664 | 1.56 |
| 44922.708333333336 | 1.601 |
| 44922.71875 | 1.678 |
| 44922.729166666664 | 1.838 |
| 44922.739583333336 | 2.066 |
| 44922.75 | 2.334 |
| 44922.760416666664 | 2.471 |
| 44922.770833333336 | 2.465 |
| 44922.78125 | 2.535 |
| 44922.791666666664 | 2.488 |
| 44922.802083333336 | 2.647 |
| 44922.8125 | 2.727 |
| 44922.822916666664 | 2.905 |
| 44922.833333333336 | 2.972 |
| 44922.84375 | 3.024 |
| 44922.854166666664 | 2.97 |
| 44922.864583333336 | 2.904 |
| 44922.875 | 2.71 |
| 44922.885416666664 | 2.609 |
| 44922.895833333336 | 2.43 |
| 44922.90625 | 2.403 |
| 44922.916666666664 | 2.347 |
| 44922.927083333336 | 2.316 |
| 44922.9375 | 2.219 |
| 44922.947916666664 | 2.177 |
| 44922.958333333336 | 2.17 |
| 44922.96875 | 2.12 |
| 44922.979166666664 | 2.156 |
| 44922.989583333336 | 2.136 |
| 44923.0 | 2.141 |
| 44923.010416666664 | 2.15 |
| 44923.020833333336 | 2.181 |
| 44923.03125 | 2.201 |
| 44923.041666666664 | 2.253 |
| 44923.052083333336 | 2.334 |
| 44923.0625 | 2.385 |
| 44923.072916666664 | 2.393 |
| 44923.083333333336 | 2.338 |
| 44923.09375 | 2.292 |
| 44923.104166666664 | 2.245 |
| 44923.114583333336 | 2.203 |
| 44923.125 | 2.169 |
| 44923.135416666664 | 2.152 |
| 44923.145833333336 | 2.119 |
| 44923.15625 | 2.167 |
| 44923.166666666664 | 2.226 |
| 44923.177083333336 | 2.301 |
| 44923.1875 | 2.362 |
| 44923.197916666664 | 2.417 |
| 44923.208333333336 | 2.451 |
| 44923.21875 | 2.447 |
| 44923.229166666664 | 2.344 |
| 44923.239583333336 | 2.356 |
| 44923.25 | 2.244 |
| 44923.260416666664 | 2.109 |
| 44923.270833333336 | 2.029 |
| 44923.28125 | 1.866 |
| 44923.291666666664 | 1.825 |
| 44923.302083333336 | 1.717 |
| 44923.3125 | 1.512 |
| 44923.322916666664 | 1.388 |
| 44923.333333333336 | 1.264 |
| 44923.34375 | 1.091 |
| 44923.354166666664 | 1.274 |
| 44923.364583333336 | 1.271 |
| 44923.375 | 1.319 |
| 44923.385416666664 | 1.275 |
| 44923.395833333336 | 1.219 |
| 44923.40625 | 1.18 |
| 44923.416666666664 | 1.151 |
| 44923.427083333336 | 1.07 |
| 44923.4375 | 1.12 |
| 44923.447916666664 | 1.108 |
| 44923.458333333336 | 1.091 |
| 44923.46875 | 1.085 |
| 44923.479166666664 | 1.085 |
| 44923.489583333336 | 1.048 |
| 44923.5 | 1.081 |
| 44923.510416666664 | 1.093 |
| 44923.520833333336 | 1.111 |
| 44923.53125 | 1.133 |
| 44923.541666666664 | 1.156 |
| 44923.552083333336 | 1.215 |
| 44923.5625 | 1.258 |
| 44923.572916666664 | 1.272 |
| 44923.583333333336 | 1.273 |
| 44923.59375 | 1.291 |
| 44923.604166666664 | 1.312 |
| 44923.614583333336 | 1.41 |
| 44923.625 | 1.52 |
| 44923.635416666664 | 1.596 |
| 44923.645833333336 | 1.719 |
| 44923.65625 | 1.876 |
| 44923.666666666664 | 2.075 |
| 44923.677083333336 | 2.252 |
| 44923.6875 | 2.456 |
| 44923.697916666664 | 2.564 |
| 44923.708333333336 | 2.637 |
| 44923.71875 | 2.681 |
| 44923.729166666664 | 2.689 |
| 44923.739583333336 | 2.777 |
| 44923.75 | 2.591 |
| 44923.760416666664 | 2.864 |
| 44923.770833333336 | 2.978 |
| 44923.78125 | 3.133 |
| 44923.791666666664 | 3.379 |
| 44923.802083333336 | 3.514 |
| 44923.8125 | 3.48 |
| 44923.822916666664 | 3.506 |
| 44923.833333333336 | 3.688 |
| 44923.84375 | 3.876 |
| 44923.854166666664 | 3.915 |
| 44923.864583333336 | 4.095 |
| 44923.875 | 4.169 |
| 44923.885416666664 | 3.978 |
| 44923.895833333336 | 3.813 |
| 44923.90625 | 3.726 |
| 44923.916666666664 | 3.638 |
| 44923.927083333336 | 3.58 |
| 44923.9375 | 3.515 |
| 44923.947916666664 | 3.523 |
| 44923.958333333336 | 3.506 |
| 44923.96875 | 3.487 |
| 44923.979166666664 | 3.487 |
| 44923.989583333336 | 3.499 |
| 44924.0 | 3.517 |
| 44924.010416666664 | 3.489 |
| 44924.020833333336 | 3.433 |
| 44924.03125 | 3.454 |
| 44924.041666666664 | 3.463 |
| 44924.052083333336 | 3.438 |
| 44924.0625 | 3.442 |
| 44924.072916666664 | 3.391 |
| 44924.083333333336 | 3.406 |
| 44924.09375 | 3.428 |
| 44924.104166666664 | 3.416 |
| 44924.114583333336 | 3.346 |
| 44924.125 | 3.304 |
| 44924.135416666664 | 3.188 |
| 44924.145833333336 | 3.129 |
| 44924.15625 | 3.066 |
| 44924.166666666664 | 3.047 |
| 44924.177083333336 | 3.02 |
| 44924.1875 | 2.989 |
| 44924.197916666664 | 3.055 |
| 44924.208333333336 | 3.129 |
| 44924.21875 | 3.189 |
| 44924.229166666664 | 3.243 |
| 44924.239583333336 | 3.251 |
| 44924.25 | 3.256 |
| 44924.260416666664 | 3.245 |
| 44924.270833333336 | 3.205 |
| 44924.28125 | 3.195 |
| 44924.291666666664 | 3.041 |
| 44924.302083333336 | 2.948 |
| 44924.3125 | 2.883 |
| 44924.322916666664 | 2.767 |
| 44924.333333333336 | 2.709 |
| 44924.34375 | 2.693 |
| 44924.354166666664 | 2.672 |
| 44924.364583333336 | 2.494 |
| 44924.375 | 2.232 |
| 44924.385416666664 | 2.279 |
| 44924.395833333336 | 2.336 |
| 44924.40625 | 2.358 |
| 44924.416666666664 | 2.35 |
| 44924.427083333336 | 2.352 |
| 44924.4375 | 2.325 |
| 44924.447916666664 | 2.32 |
| 44924.458333333336 | 2.318 |
| 44924.46875 | 2.329 |
| 44924.479166666664 | 2.297 |
| 44924.489583333336 | 2.308 |
| 44924.5 | 2.258 |
| 44924.510416666664 | 2.256 |
| 44924.520833333336 | 2.265 |
| 44924.53125 | 2.232 |
| 44924.541666666664 | 2.247 |
| 44924.552083333336 | 2.285 |
| 44924.5625 | 2.315 |
| 44924.572916666664 | 2.334 |
| 44924.583333333336 | 2.333 |
| 44924.59375 | 2.383 |
| 44924.604166666664 | 2.415 |
| 44924.614583333336 | 2.437 |
| 44924.625 | 2.471 |
| 44924.635416666664 | 2.495 |
| 44924.645833333336 | 2.549 |
| 44924.65625 | 2.604 |
| 44924.666666666664 | 2.697 |
| 44924.677083333336 | 2.782 |
| 44924.6875 | 2.883 |
| 44924.697916666664 | 2.985 |
| 44924.708333333336 | 3.123 |
| 44924.71875 | 3.301 |
| 44924.729166666664 | 3.421 |
| 44924.739583333336 | 3.562 |
| 44924.75 | 3.85 |
| 44924.760416666664 | 3.86 |
| 44924.770833333336 | 3.851 |
| 44924.78125 | 3.623 |
| 44924.791666666664 | 3.872 |
| 44924.802083333336 | 3.884 |
| 44924.8125 | 4.251 |
| 44924.822916666664 | 4.64 |
| 44924.833333333336 | 4.861 |
| 44924.84375 | 4.72 |
| 44924.854166666664 | 4.635 |
| 44924.864583333336 | 4.71 |
| 44924.875 | 4.691 |
| 44924.885416666664 | 4.77 |
| 44924.895833333336 | 4.909 |
| 44924.90625 | 5.036 |
| 44924.916666666664 | 4.91 |
| 44924.927083333336 | 4.984 |
| 44924.9375 | 4.942 |
| 44924.947916666664 | 4.955 |
| 44924.958333333336 | 4.894 |
| 44924.96875 | 4.878 |
| 44924.979166666664 | 4.853 |
| 44924.989583333336 | 4.856 |
| 44925.0 | 4.852 |
| 44925.010416666664 | 4.882 |
| 44925.020833333336 | 4.905 |
| 44925.03125 | 4.913 |
| 44925.041666666664 | 4.868 |
| 44925.052083333336 | 4.834 |
| 44925.0625 | 4.794 |
| 44925.072916666664 | 4.858 |
| 44925.083333333336 | 4.822 |
| 44925.09375 | 4.784 |
| 44925.104166666664 | 4.746 |
| 44925.114583333336 | 4.64 |
| 44925.125 | 4.607 |
| 44925.135416666664 | 4.524 |
| 44925.145833333336 | 4.449 |
| 44925.15625 | 4.301 |
| 44925.166666666664 | 4.173 |
| 44925.177083333336 | 4.084 |
| 44925.1875 | 4.028 |
| 44925.197916666664 | 3.972 |
| 44925.208333333336 | 3.937 |
| 44925.21875 | 3.909 |
| 44925.229166666664 | 3.899 |
| 44925.239583333336 | 3.904 |
| 44925.25 | 3.923 |
| 44925.260416666664 | 3.951 |
| 44925.270833333336 | 3.97 |
| 44925.28125 | 3.984 |
| 44925.291666666664 | 3.996 |
| 44925.302083333336 | 3.987 |
| 44925.3125 | 3.999 |
| 44925.322916666664 | 3.96 |
| 44925.333333333336 | 3.915 |
| 44925.34375 | 3.81 |
| 44925.354166666664 | 3.627 |
| 44925.364583333336 | 3.611 |
| 44925.375 | 3.504 |
| 44925.385416666664 | 3.571 |
| 44925.395833333336 | 3.519 |
| 44925.40625 | 3.398 |
| 44925.416666666664 | 3.297 |
| 44925.427083333336 | 3.341 |
| 44925.4375 | 3.439 |
| 44925.447916666664 | 3.535 |
| 44925.458333333336 | 3.622 |
| 44925.46875 | 3.657 |
| 44925.479166666664 | 3.669 |
| 44925.489583333336 | 3.72 |
| 44925.5 | 3.7 |
| 44925.510416666664 | 3.71 |
| 44925.520833333336 | 3.679 |
| 44925.53125 | 3.754 |
| 44925.541666666664 | 3.708 |
| 44925.552083333336 | 3.74 |
| 44925.5625 | 3.772 |
| 44925.572916666664 | 3.745 |
| 44925.583333333336 | 3.799 |
| 44925.59375 | 3.833 |
| 44925.604166666664 | 3.855 |
| 44925.614583333336 | 3.868 |
| 44925.625 | 3.842 |
| 44925.635416666664 | 3.853 |
| 44925.645833333336 | 3.9 |
| 44925.65625 | 3.945 |
| 44925.666666666664 | 4.02 |
| 44925.677083333336 | 4.072 |
| 44925.6875 | 4.142 |
| 44925.697916666664 | 4.241 |
| 44925.708333333336 | 4.33 |
| 44925.71875 | 4.387 |
| 44925.729166666664 | 4.448 |
| 44925.739583333336 | 4.517 |
| 44925.75 | 4.606 |
| 44925.760416666664 | 4.74 |
| 44925.770833333336 | 4.845 |
| 44925.78125 | 5.008 |
| 44925.791666666664 | 5.046 |
| 44925.802083333336 | 5.191 |
| 44925.8125 | 5.231 |
| 44925.822916666664 | 5.17 |
| 44925.833333333336 | 5.047 |
| 44925.84375 | 5.3 |
| 44925.854166666664 | 5.494 |
| 44925.864583333336 | 5.716 |
| 44925.875 | 5.913 |
| 44925.885416666664 | 6.013 |
| 44925.895833333336 | 5.823 |
| 44925.90625 | 5.813 |
| 44925.916666666664 | 5.748 |
| 44925.927083333336 | 5.804 |
| 44925.9375 | 5.955 |
| 44925.947916666664 | 6.215 |
| 44925.958333333336 | 6.252 |
| 44925.96875 | 6.277 |
| 44925.979166666664 | 6.35 |
| 44925.989583333336 | 6.404 |
| 44926.0 | 6.395 |
| 44926.010416666664 | 6.377 |
| 44926.020833333336 | 6.323 |
| 44926.03125 | 6.336 |
| 44926.041666666664 | 6.338 |
| 44926.052083333336 | 6.355 |
| 44926.0625 | 6.385 |
| 44926.072916666664 | 6.323 |
| 44926.083333333336 | 6.327 |
| 44926.09375 | 6.333 |
| 44926.104166666664 | 6.315 |
| 44926.114583333336 | 6.3 |
| 44926.125 | 6.311 |
| 44926.135416666664 | 6.286 |
| 44926.145833333336 | 6.199 |
| 44926.15625 | 6.138 |
| 44926.166666666664 | 6.067 |
| 44926.177083333336 | 6.009 |
| 44926.1875 | 5.951 |
| 44926.197916666664 | 5.903 |
| 44926.208333333336 | 5.849 |
| 44926.21875 | 5.797 |
| 44926.229166666664 | 5.766 |
| 44926.239583333336 | 5.748 |
| 44926.25 | 5.711 |
| 44926.260416666664 | 5.588 |
| 44926.270833333336 | 5.492 |
| 44926.28125 | 5.442 |
| 44926.291666666664 | 5.432 |
| 44926.302083333336 | 5.428 |
| 44926.3125 | 5.414 |
| 44926.322916666664 | 5.415 |
| 44926.333333333336 | 5.411 |
| 44926.34375 | 5.408 |
| 44926.354166666664 | 5.529 |
| 44926.364583333336 | 5.516 |
| 44926.375 | 5.494 |
| 44926.385416666664 | 5.561 |
| 44926.395833333336 | 5.562 |
| 44926.40625 | 5.704 |
| 44926.416666666664 | 5.714 |
| 44926.427083333336 | 5.894 |
| 44926.4375 | 5.713 |
| 44926.447916666664 | 5.816 |
| 44926.458333333336 | 5.999 |
| 44926.46875 | 6.415 |
| 44926.479166666664 | 6.411 |
| 44926.489583333336 | 6.372 |
| 44926.5 | 6.375 |
| 44926.510416666664 | 6.444 |
| 44926.520833333336 | 6.515 |
| 44926.53125 | 6.637 |
| 44926.541666666664 | 6.696 |
| 44926.552083333336 | 6.773 |
| 44926.5625 | 6.818 |
| 44926.572916666664 | 6.893 |
| 44926.583333333336 | 6.97 |
| 44926.59375 | 6.964 |
| 44926.604166666664 | 6.916 |
| 44926.614583333336 | 6.947 |
| 44926.625 | 6.978 |
| 44926.635416666664 | 6.993 |
| 44926.645833333336 | 7.022 |
| 44926.65625 | 7.094 |
| 44926.666666666664 | 6.964 |
| 44926.677083333336 | 6.977 |
| 44926.6875 | 6.825 |
| 44926.697916666664 | 6.743 |
| 44926.708333333336 | 6.747 |
| 44926.71875 | 6.741 |
| 44926.729166666664 | 6.806 |
| 44926.739583333336 | 6.886 |
| 44926.75 | 6.963 |
| 44926.760416666664 | 7.141 |
| 44926.770833333336 | 7.169 |
| 44926.78125 | 7.439 |
| 44926.791666666664 | 7.242 |
| 44926.802083333336 | 7.097 |
| 44926.8125 | 6.954 |
| 44926.822916666664 | 6.944 |
| 44926.833333333336 | 6.93 |
| 44926.84375 | 6.891 |
| 44926.854166666664 | 6.92 |
| 44926.864583333336 | 6.821 |
| 44926.875 | 6.984 |
| 44926.885416666664 | 6.97 |
| 44926.895833333336 | 6.85 |
| 44926.90625 | 7.183 |
| 44926.916666666664 | 7.318 |
| 44926.927083333336 | 7.382 |
| 44926.9375 | 7.375 |
| 44926.947916666664 | 7.643 |
| 44926.958333333336 | 7.751 |
| 44926.96875 | 8.195 |
| 44926.979166666664 | 7.957 |
| 44926.989583333336 | 7.824 |
| 44927.0 | 7.86 |
| 44927.010416666664 | 7.949 |
| 44927.020833333336 | 8.177 |
| 44927.03125 | 8.436 |
| 44927.041666666664 | 8.57 |
| 44927.052083333336 | 8.62 |
| 44927.0625 | 8.721 |
| 44927.072916666664 | 8.693 |
| 44927.083333333336 | 8.701 |
| 44927.09375 | 8.685 |
| 44927.104166666664 | 8.69 |
| 44927.114583333336 | 8.61 |
| 44927.125 | 8.546 |
| 44927.135416666664 | 8.492 |
| 44927.145833333336 | 8.543 |